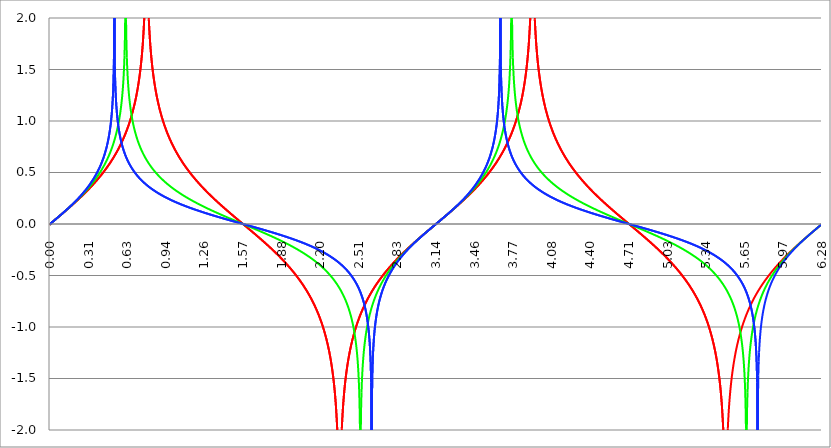
| Category | Series 1 | Series 0 | Series 2 |
|---|---|---|---|
| 0.0 | 0 | 0 | 0 |
| 0.00314159265358979 | -0.003 | -0.002 | -0.001 |
| 0.00628318530717958 | 0.006 | 0.006 | 0.006 |
| 0.00942477796076938 | 0.009 | 0.009 | 0.009 |
| 0.0125663706143592 | 0.013 | 0.013 | 0.013 |
| 0.015707963267949 | 0.016 | 0.016 | 0.016 |
| 0.0188495559215388 | 0.019 | 0.019 | 0.019 |
| 0.0219911485751285 | 0.022 | 0.022 | 0.022 |
| 0.0251327412287183 | 0.025 | 0.025 | 0.025 |
| 0.0282743338823081 | 0.028 | 0.028 | 0.028 |
| 0.0314159265358979 | 0.031 | 0.031 | 0.031 |
| 0.0345575191894877 | 0.035 | 0.035 | 0.035 |
| 0.0376991118430775 | 0.038 | 0.038 | 0.038 |
| 0.0408407044966673 | 0.041 | 0.041 | 0.041 |
| 0.0439822971502571 | 0.044 | 0.044 | 0.044 |
| 0.0471238898038469 | 0.047 | 0.047 | 0.047 |
| 0.0502654824574367 | 0.05 | 0.05 | 0.05 |
| 0.0534070751110265 | 0.054 | 0.054 | 0.054 |
| 0.0565486677646163 | 0.057 | 0.057 | 0.057 |
| 0.059690260418206 | 0.06 | 0.06 | 0.06 |
| 0.0628318530717958 | 0.063 | 0.063 | 0.063 |
| 0.0659734457253856 | 0.066 | 0.066 | 0.066 |
| 0.0691150383789754 | 0.069 | 0.069 | 0.07 |
| 0.0722566310325652 | 0.073 | 0.073 | 0.073 |
| 0.075398223686155 | 0.076 | 0.076 | 0.076 |
| 0.0785398163397448 | 0.079 | 0.079 | 0.079 |
| 0.0816814089933346 | 0.082 | 0.082 | 0.082 |
| 0.0848230016469244 | 0.085 | 0.085 | 0.086 |
| 0.0879645943005142 | 0.088 | 0.089 | 0.089 |
| 0.091106186954104 | 0.092 | 0.092 | 0.092 |
| 0.0942477796076937 | 0.095 | 0.095 | 0.095 |
| 0.0973893722612835 | 0.098 | 0.098 | 0.099 |
| 0.100530964914873 | 0.101 | 0.102 | 0.102 |
| 0.103672557568463 | 0.104 | 0.105 | 0.105 |
| 0.106814150222053 | 0.108 | 0.108 | 0.108 |
| 0.109955742875643 | 0.111 | 0.111 | 0.112 |
| 0.113097335529233 | 0.114 | 0.115 | 0.115 |
| 0.116238928182822 | 0.117 | 0.118 | 0.118 |
| 0.119380520836412 | 0.121 | 0.121 | 0.122 |
| 0.122522113490002 | 0.124 | 0.124 | 0.125 |
| 0.125663706143592 | 0.127 | 0.128 | 0.128 |
| 0.128805298797181 | 0.13 | 0.131 | 0.132 |
| 0.131946891450771 | 0.134 | 0.134 | 0.135 |
| 0.135088484104361 | 0.137 | 0.138 | 0.139 |
| 0.138230076757951 | 0.14 | 0.141 | 0.142 |
| 0.141371669411541 | 0.143 | 0.144 | 0.145 |
| 0.14451326206513 | 0.147 | 0.148 | 0.149 |
| 0.14765485471872 | 0.15 | 0.151 | 0.152 |
| 0.15079644737231 | 0.153 | 0.154 | 0.156 |
| 0.1539380400259 | 0.156 | 0.158 | 0.159 |
| 0.15707963267949 | 0.16 | 0.161 | 0.163 |
| 0.160221225333079 | 0.163 | 0.165 | 0.166 |
| 0.163362817986669 | 0.166 | 0.168 | 0.17 |
| 0.166504410640259 | 0.17 | 0.171 | 0.173 |
| 0.169646003293849 | 0.173 | 0.175 | 0.177 |
| 0.172787595947439 | 0.176 | 0.178 | 0.18 |
| 0.175929188601028 | 0.18 | 0.182 | 0.184 |
| 0.179070781254618 | 0.183 | 0.185 | 0.187 |
| 0.182212373908208 | 0.186 | 0.189 | 0.191 |
| 0.185353966561798 | 0.19 | 0.192 | 0.195 |
| 0.188495559215388 | 0.193 | 0.196 | 0.198 |
| 0.191637151868977 | 0.197 | 0.199 | 0.202 |
| 0.194778744522567 | 0.2 | 0.203 | 0.206 |
| 0.197920337176157 | 0.203 | 0.206 | 0.209 |
| 0.201061929829747 | 0.207 | 0.21 | 0.213 |
| 0.204203522483336 | 0.21 | 0.213 | 0.217 |
| 0.207345115136926 | 0.214 | 0.217 | 0.22 |
| 0.210486707790516 | 0.217 | 0.221 | 0.224 |
| 0.213628300444106 | 0.22 | 0.224 | 0.228 |
| 0.216769893097696 | 0.224 | 0.228 | 0.232 |
| 0.219911485751285 | 0.227 | 0.231 | 0.236 |
| 0.223053078404875 | 0.231 | 0.235 | 0.24 |
| 0.226194671058465 | 0.234 | 0.239 | 0.244 |
| 0.229336263712055 | 0.238 | 0.243 | 0.248 |
| 0.232477856365645 | 0.241 | 0.246 | 0.252 |
| 0.235619449019234 | 0.245 | 0.25 | 0.256 |
| 0.238761041672824 | 0.248 | 0.254 | 0.26 |
| 0.241902634326414 | 0.252 | 0.258 | 0.264 |
| 0.245044226980004 | 0.255 | 0.261 | 0.268 |
| 0.248185819633594 | 0.259 | 0.265 | 0.272 |
| 0.251327412287183 | 0.263 | 0.269 | 0.276 |
| 0.254469004940773 | 0.266 | 0.273 | 0.28 |
| 0.257610597594363 | 0.27 | 0.277 | 0.284 |
| 0.260752190247953 | 0.273 | 0.281 | 0.289 |
| 0.263893782901543 | 0.277 | 0.285 | 0.293 |
| 0.267035375555132 | 0.281 | 0.289 | 0.297 |
| 0.270176968208722 | 0.284 | 0.293 | 0.302 |
| 0.273318560862312 | 0.288 | 0.297 | 0.306 |
| 0.276460153515902 | 0.292 | 0.301 | 0.311 |
| 0.279601746169492 | 0.295 | 0.305 | 0.315 |
| 0.282743338823082 | 0.299 | 0.309 | 0.32 |
| 0.285884931476671 | 0.303 | 0.313 | 0.324 |
| 0.289026524130261 | 0.307 | 0.317 | 0.329 |
| 0.292168116783851 | 0.31 | 0.321 | 0.334 |
| 0.295309709437441 | 0.314 | 0.325 | 0.338 |
| 0.298451302091031 | 0.318 | 0.33 | 0.343 |
| 0.30159289474462 | 0.322 | 0.334 | 0.348 |
| 0.30473448739821 | 0.326 | 0.338 | 0.353 |
| 0.3078760800518 | 0.329 | 0.342 | 0.358 |
| 0.31101767270539 | 0.333 | 0.347 | 0.363 |
| 0.31415926535898 | 0.337 | 0.351 | 0.368 |
| 0.31730085801257 | 0.341 | 0.356 | 0.373 |
| 0.320442450666159 | 0.345 | 0.36 | 0.378 |
| 0.323584043319749 | 0.349 | 0.365 | 0.383 |
| 0.326725635973339 | 0.353 | 0.369 | 0.389 |
| 0.329867228626929 | 0.357 | 0.374 | 0.394 |
| 0.333008821280519 | 0.361 | 0.378 | 0.399 |
| 0.336150413934108 | 0.365 | 0.383 | 0.405 |
| 0.339292006587698 | 0.369 | 0.388 | 0.411 |
| 0.342433599241288 | 0.373 | 0.392 | 0.416 |
| 0.345575191894878 | 0.377 | 0.397 | 0.422 |
| 0.348716784548468 | 0.381 | 0.402 | 0.428 |
| 0.351858377202058 | 0.385 | 0.407 | 0.434 |
| 0.354999969855647 | 0.389 | 0.412 | 0.44 |
| 0.358141562509237 | 0.393 | 0.417 | 0.446 |
| 0.361283155162827 | 0.398 | 0.422 | 0.452 |
| 0.364424747816417 | 0.402 | 0.427 | 0.458 |
| 0.367566340470007 | 0.406 | 0.432 | 0.465 |
| 0.370707933123597 | 0.41 | 0.437 | 0.471 |
| 0.373849525777186 | 0.415 | 0.442 | 0.478 |
| 0.376991118430776 | 0.419 | 0.447 | 0.485 |
| 0.380132711084366 | 0.423 | 0.453 | 0.492 |
| 0.383274303737956 | 0.427 | 0.458 | 0.499 |
| 0.386415896391546 | 0.432 | 0.464 | 0.506 |
| 0.389557489045135 | 0.436 | 0.469 | 0.513 |
| 0.392699081698725 | 0.441 | 0.475 | 0.521 |
| 0.395840674352315 | 0.445 | 0.48 | 0.529 |
| 0.398982267005905 | 0.45 | 0.486 | 0.536 |
| 0.402123859659495 | 0.454 | 0.492 | 0.544 |
| 0.405265452313085 | 0.459 | 0.498 | 0.553 |
| 0.408407044966674 | 0.463 | 0.504 | 0.561 |
| 0.411548637620264 | 0.468 | 0.51 | 0.57 |
| 0.414690230273854 | 0.473 | 0.516 | 0.579 |
| 0.417831822927444 | 0.477 | 0.522 | 0.588 |
| 0.420973415581034 | 0.482 | 0.528 | 0.597 |
| 0.424115008234623 | 0.487 | 0.534 | 0.607 |
| 0.427256600888213 | 0.491 | 0.541 | 0.616 |
| 0.430398193541803 | 0.496 | 0.547 | 0.627 |
| 0.433539786195393 | 0.501 | 0.554 | 0.637 |
| 0.436681378848983 | 0.506 | 0.561 | 0.648 |
| 0.439822971502573 | 0.511 | 0.568 | 0.659 |
| 0.442964564156162 | 0.516 | 0.574 | 0.671 |
| 0.446106156809752 | 0.521 | 0.582 | 0.683 |
| 0.449247749463342 | 0.526 | 0.589 | 0.696 |
| 0.452389342116932 | 0.531 | 0.596 | 0.709 |
| 0.455530934770522 | 0.536 | 0.603 | 0.722 |
| 0.458672527424111 | 0.541 | 0.611 | 0.736 |
| 0.461814120077701 | 0.546 | 0.619 | 0.751 |
| 0.464955712731291 | 0.551 | 0.627 | 0.767 |
| 0.468097305384881 | 0.557 | 0.635 | 0.783 |
| 0.471238898038471 | 0.562 | 0.643 | 0.801 |
| 0.474380490692061 | 0.567 | 0.651 | 0.819 |
| 0.47752208334565 | 0.573 | 0.659 | 0.839 |
| 0.48066367599924 | 0.578 | 0.668 | 0.86 |
| 0.48380526865283 | 0.584 | 0.677 | 0.882 |
| 0.48694686130642 | 0.589 | 0.686 | 0.907 |
| 0.49008845396001 | 0.595 | 0.695 | 0.933 |
| 0.493230046613599 | 0.601 | 0.705 | 0.962 |
| 0.496371639267189 | 0.606 | 0.714 | 0.994 |
| 0.499513231920779 | 0.612 | 0.724 | 1.03 |
| 0.502654824574369 | 0.618 | 0.735 | 1.071 |
| 0.505796417227959 | 0.624 | 0.745 | 1.118 |
| 0.508938009881549 | 0.63 | 0.756 | 1.175 |
| 0.512079602535138 | 0.636 | 0.767 | 1.245 |
| 0.515221195188728 | 0.642 | 0.778 | 1.338 |
| 0.518362787842318 | 0.648 | 0.79 | 1.474 |
| 0.521504380495908 | 0.654 | 0.802 | 1.739 |
| 0.524645973149498 | 0.661 | 0.815 | 3 |
| 0.527787565803087 | 0.667 | 0.828 | 1.54 |
| 0.530929158456677 | 0.673 | 0.841 | 1.379 |
| 0.534070751110267 | 0.68 | 0.855 | 1.276 |
| 0.537212343763857 | 0.686 | 0.869 | 1.201 |
| 0.540353936417447 | 0.693 | 0.884 | 1.142 |
| 0.543495529071037 | 0.7 | 0.9 | 1.093 |
| 0.546637121724626 | 0.707 | 0.916 | 1.051 |
| 0.549778714378216 | 0.713 | 0.933 | 1.014 |
| 0.552920307031806 | 0.72 | 0.951 | 0.982 |
| 0.556061899685396 | 0.727 | 0.969 | 0.953 |
| 0.559203492338986 | 0.735 | 0.989 | 0.927 |
| 0.562345084992576 | 0.742 | 1.01 | 0.903 |
| 0.565486677646165 | 0.749 | 1.032 | 0.881 |
| 0.568628270299755 | 0.757 | 1.055 | 0.861 |
| 0.571769862953345 | 0.764 | 1.08 | 0.842 |
| 0.574911455606935 | 0.772 | 1.107 | 0.824 |
| 0.578053048260525 | 0.779 | 1.136 | 0.807 |
| 0.581194640914114 | 0.787 | 1.167 | 0.792 |
| 0.584336233567704 | 0.795 | 1.202 | 0.777 |
| 0.587477826221294 | 0.803 | 1.24 | 0.763 |
| 0.590619418874884 | 0.812 | 1.282 | 0.749 |
| 0.593761011528474 | 0.82 | 1.33 | 0.736 |
| 0.596902604182064 | 0.828 | 1.386 | 0.724 |
| 0.600044196835653 | 0.837 | 1.452 | 0.713 |
| 0.603185789489243 | 0.846 | 1.533 | 0.701 |
| 0.606327382142833 | 0.855 | 1.638 | 0.691 |
| 0.609468974796423 | 0.864 | 1.787 | 0.68 |
| 0.612610567450013 | 0.873 | 2.048 | 0.671 |
| 0.615752160103602 | 0.882 | 2.881 | 0.661 |
| 0.618893752757192 | 0.892 | 1.988 | 0.652 |
| 0.622035345410782 | 0.901 | 1.757 | 0.643 |
| 0.625176938064372 | 0.911 | 1.619 | 0.634 |
| 0.628318530717962 | 0.921 | 1.521 | 0.626 |
| 0.631460123371551 | 0.932 | 1.444 | 0.618 |
| 0.634601716025141 | 0.942 | 1.38 | 0.61 |
| 0.637743308678731 | 0.953 | 1.327 | 0.602 |
| 0.640884901332321 | 0.964 | 1.281 | 0.595 |
| 0.644026493985911 | 0.975 | 1.24 | 0.588 |
| 0.647168086639501 | 0.986 | 1.203 | 0.581 |
| 0.65030967929309 | 0.998 | 1.17 | 0.574 |
| 0.65345127194668 | 1.01 | 1.14 | 0.567 |
| 0.65659286460027 | 1.022 | 1.112 | 0.561 |
| 0.65973445725386 | 1.034 | 1.087 | 0.554 |
| 0.66287604990745 | 1.047 | 1.063 | 0.548 |
| 0.666017642561039 | 1.06 | 1.041 | 0.542 |
| 0.669159235214629 | 1.074 | 1.02 | 0.536 |
| 0.672300827868219 | 1.088 | 1 | 0.53 |
| 0.675442420521809 | 1.102 | 0.981 | 0.525 |
| 0.678584013175399 | 1.116 | 0.963 | 0.519 |
| 0.681725605828989 | 1.131 | 0.947 | 0.514 |
| 0.684867198482578 | 1.147 | 0.93 | 0.509 |
| 0.688008791136168 | 1.163 | 0.915 | 0.503 |
| 0.691150383789758 | 1.179 | 0.901 | 0.498 |
| 0.694291976443348 | 1.196 | 0.886 | 0.493 |
| 0.697433569096938 | 1.214 | 0.873 | 0.489 |
| 0.700575161750528 | 1.232 | 0.86 | 0.484 |
| 0.703716754404117 | 1.251 | 0.847 | 0.479 |
| 0.706858347057707 | 1.271 | 0.835 | 0.474 |
| 0.709999939711297 | 1.292 | 0.824 | 0.47 |
| 0.713141532364887 | 1.313 | 0.813 | 0.465 |
| 0.716283125018477 | 1.335 | 0.802 | 0.461 |
| 0.719424717672066 | 1.359 | 0.791 | 0.457 |
| 0.722566310325656 | 1.383 | 0.781 | 0.453 |
| 0.725707902979246 | 1.409 | 0.771 | 0.448 |
| 0.728849495632836 | 1.436 | 0.761 | 0.444 |
| 0.731991088286426 | 1.464 | 0.752 | 0.44 |
| 0.735132680940016 | 1.495 | 0.743 | 0.436 |
| 0.738274273593605 | 1.527 | 0.734 | 0.432 |
| 0.741415866247195 | 1.562 | 0.725 | 0.429 |
| 0.744557458900785 | 1.599 | 0.717 | 0.425 |
| 0.747699051554375 | 1.639 | 0.709 | 0.421 |
| 0.750840644207965 | 1.682 | 0.701 | 0.417 |
| 0.753982236861554 | 1.73 | 0.693 | 0.414 |
| 0.757123829515144 | 1.783 | 0.685 | 0.41 |
| 0.760265422168734 | 1.842 | 0.678 | 0.407 |
| 0.763407014822324 | 1.908 | 0.67 | 0.403 |
| 0.766548607475914 | 1.986 | 0.663 | 0.4 |
| 0.769690200129504 | 2.077 | 0.656 | 0.396 |
| 0.772831792783093 | 2.188 | 0.649 | 0.393 |
| 0.775973385436683 | 2.332 | 0.643 | 0.39 |
| 0.779114978090273 | 2.535 | 0.636 | 0.387 |
| 0.782256570743863 | 2.882 | 0.63 | 0.383 |
| 0.785398163397453 | 16.524 | 0.623 | 0.38 |
| 0.788539756051042 | 2.882 | 0.617 | 0.377 |
| 0.791681348704632 | 2.535 | 0.611 | 0.374 |
| 0.794822941358222 | 2.332 | 0.605 | 0.371 |
| 0.797964534011812 | 2.188 | 0.599 | 0.368 |
| 0.801106126665402 | 2.077 | 0.593 | 0.365 |
| 0.804247719318992 | 1.986 | 0.588 | 0.362 |
| 0.807389311972581 | 1.908 | 0.582 | 0.359 |
| 0.810530904626171 | 1.842 | 0.576 | 0.356 |
| 0.813672497279761 | 1.783 | 0.571 | 0.353 |
| 0.816814089933351 | 1.73 | 0.566 | 0.351 |
| 0.819955682586941 | 1.682 | 0.56 | 0.348 |
| 0.823097275240531 | 1.639 | 0.555 | 0.345 |
| 0.82623886789412 | 1.599 | 0.55 | 0.342 |
| 0.82938046054771 | 1.562 | 0.545 | 0.34 |
| 0.8325220532013 | 1.527 | 0.54 | 0.337 |
| 0.83566364585489 | 1.495 | 0.535 | 0.334 |
| 0.83880523850848 | 1.464 | 0.531 | 0.332 |
| 0.841946831162069 | 1.436 | 0.526 | 0.329 |
| 0.845088423815659 | 1.409 | 0.521 | 0.327 |
| 0.848230016469249 | 1.383 | 0.517 | 0.324 |
| 0.851371609122839 | 1.359 | 0.512 | 0.322 |
| 0.854513201776429 | 1.335 | 0.508 | 0.319 |
| 0.857654794430019 | 1.313 | 0.503 | 0.317 |
| 0.860796387083608 | 1.292 | 0.499 | 0.314 |
| 0.863937979737198 | 1.271 | 0.494 | 0.312 |
| 0.867079572390788 | 1.251 | 0.49 | 0.309 |
| 0.870221165044378 | 1.232 | 0.486 | 0.307 |
| 0.873362757697968 | 1.214 | 0.482 | 0.305 |
| 0.876504350351557 | 1.196 | 0.478 | 0.302 |
| 0.879645943005147 | 1.179 | 0.474 | 0.3 |
| 0.882787535658737 | 1.163 | 0.47 | 0.298 |
| 0.885929128312327 | 1.147 | 0.466 | 0.296 |
| 0.889070720965917 | 1.131 | 0.462 | 0.293 |
| 0.892212313619507 | 1.116 | 0.458 | 0.291 |
| 0.895353906273096 | 1.102 | 0.454 | 0.289 |
| 0.898495498926686 | 1.088 | 0.45 | 0.287 |
| 0.901637091580276 | 1.074 | 0.447 | 0.285 |
| 0.904778684233866 | 1.06 | 0.443 | 0.283 |
| 0.907920276887456 | 1.047 | 0.439 | 0.28 |
| 0.911061869541045 | 1.034 | 0.436 | 0.278 |
| 0.914203462194635 | 1.022 | 0.432 | 0.276 |
| 0.917345054848225 | 1.01 | 0.429 | 0.274 |
| 0.920486647501815 | 0.998 | 0.425 | 0.272 |
| 0.923628240155405 | 0.986 | 0.422 | 0.27 |
| 0.926769832808995 | 0.975 | 0.418 | 0.268 |
| 0.929911425462584 | 0.964 | 0.415 | 0.266 |
| 0.933053018116174 | 0.953 | 0.411 | 0.264 |
| 0.936194610769764 | 0.942 | 0.408 | 0.262 |
| 0.939336203423354 | 0.932 | 0.405 | 0.26 |
| 0.942477796076944 | 0.921 | 0.401 | 0.258 |
| 0.945619388730533 | 0.911 | 0.398 | 0.256 |
| 0.948760981384123 | 0.901 | 0.395 | 0.254 |
| 0.951902574037713 | 0.892 | 0.392 | 0.252 |
| 0.955044166691303 | 0.882 | 0.389 | 0.25 |
| 0.958185759344893 | 0.873 | 0.386 | 0.249 |
| 0.961327351998483 | 0.864 | 0.382 | 0.247 |
| 0.964468944652072 | 0.855 | 0.379 | 0.245 |
| 0.967610537305662 | 0.846 | 0.376 | 0.243 |
| 0.970752129959252 | 0.837 | 0.373 | 0.241 |
| 0.973893722612842 | 0.828 | 0.37 | 0.239 |
| 0.977035315266432 | 0.82 | 0.367 | 0.238 |
| 0.980176907920022 | 0.812 | 0.364 | 0.236 |
| 0.983318500573611 | 0.803 | 0.361 | 0.234 |
| 0.986460093227201 | 0.795 | 0.359 | 0.232 |
| 0.989601685880791 | 0.787 | 0.356 | 0.23 |
| 0.992743278534381 | 0.779 | 0.353 | 0.229 |
| 0.995884871187971 | 0.772 | 0.35 | 0.227 |
| 0.99902646384156 | 0.764 | 0.347 | 0.225 |
| 1.00216805649515 | 0.757 | 0.344 | 0.224 |
| 1.00530964914874 | 0.749 | 0.342 | 0.222 |
| 1.00845124180233 | 0.742 | 0.339 | 0.22 |
| 1.01159283445592 | 0.735 | 0.336 | 0.218 |
| 1.01473442710951 | 0.727 | 0.333 | 0.217 |
| 1.017876019763099 | 0.72 | 0.331 | 0.215 |
| 1.021017612416689 | 0.713 | 0.328 | 0.213 |
| 1.02415920507028 | 0.707 | 0.325 | 0.212 |
| 1.027300797723869 | 0.7 | 0.323 | 0.21 |
| 1.030442390377459 | 0.693 | 0.32 | 0.209 |
| 1.033583983031048 | 0.686 | 0.318 | 0.207 |
| 1.036725575684638 | 0.68 | 0.315 | 0.205 |
| 1.039867168338228 | 0.673 | 0.312 | 0.204 |
| 1.043008760991818 | 0.667 | 0.31 | 0.202 |
| 1.046150353645408 | 0.661 | 0.307 | 0.201 |
| 1.049291946298998 | 0.654 | 0.305 | 0.199 |
| 1.052433538952587 | 0.648 | 0.302 | 0.197 |
| 1.055575131606177 | 0.642 | 0.3 | 0.196 |
| 1.058716724259767 | 0.636 | 0.297 | 0.194 |
| 1.061858316913357 | 0.63 | 0.295 | 0.193 |
| 1.064999909566947 | 0.624 | 0.293 | 0.191 |
| 1.068141502220536 | 0.618 | 0.29 | 0.19 |
| 1.071283094874126 | 0.612 | 0.288 | 0.188 |
| 1.074424687527716 | 0.606 | 0.285 | 0.187 |
| 1.077566280181306 | 0.601 | 0.283 | 0.185 |
| 1.080707872834896 | 0.595 | 0.281 | 0.184 |
| 1.083849465488486 | 0.589 | 0.278 | 0.182 |
| 1.086991058142075 | 0.584 | 0.276 | 0.181 |
| 1.090132650795665 | 0.578 | 0.274 | 0.179 |
| 1.093274243449255 | 0.573 | 0.271 | 0.178 |
| 1.096415836102845 | 0.567 | 0.269 | 0.176 |
| 1.099557428756435 | 0.562 | 0.267 | 0.175 |
| 1.102699021410025 | 0.557 | 0.264 | 0.174 |
| 1.105840614063614 | 0.551 | 0.262 | 0.172 |
| 1.108982206717204 | 0.546 | 0.26 | 0.171 |
| 1.112123799370794 | 0.541 | 0.258 | 0.169 |
| 1.115265392024384 | 0.536 | 0.256 | 0.168 |
| 1.118406984677974 | 0.531 | 0.253 | 0.166 |
| 1.121548577331563 | 0.526 | 0.251 | 0.165 |
| 1.124690169985153 | 0.521 | 0.249 | 0.164 |
| 1.127831762638743 | 0.516 | 0.247 | 0.162 |
| 1.130973355292333 | 0.511 | 0.245 | 0.161 |
| 1.134114947945923 | 0.506 | 0.242 | 0.16 |
| 1.137256540599513 | 0.501 | 0.24 | 0.158 |
| 1.140398133253102 | 0.496 | 0.238 | 0.157 |
| 1.143539725906692 | 0.491 | 0.236 | 0.155 |
| 1.146681318560282 | 0.487 | 0.234 | 0.154 |
| 1.149822911213872 | 0.482 | 0.232 | 0.153 |
| 1.152964503867462 | 0.477 | 0.23 | 0.151 |
| 1.156106096521051 | 0.473 | 0.228 | 0.15 |
| 1.159247689174641 | 0.468 | 0.226 | 0.149 |
| 1.162389281828231 | 0.463 | 0.224 | 0.147 |
| 1.165530874481821 | 0.459 | 0.221 | 0.146 |
| 1.168672467135411 | 0.454 | 0.219 | 0.145 |
| 1.171814059789001 | 0.45 | 0.217 | 0.143 |
| 1.17495565244259 | 0.445 | 0.215 | 0.142 |
| 1.17809724509618 | 0.441 | 0.213 | 0.141 |
| 1.18123883774977 | 0.436 | 0.211 | 0.139 |
| 1.18438043040336 | 0.432 | 0.209 | 0.138 |
| 1.18752202305695 | 0.427 | 0.207 | 0.137 |
| 1.190663615710539 | 0.423 | 0.205 | 0.136 |
| 1.193805208364129 | 0.419 | 0.203 | 0.134 |
| 1.19694680101772 | 0.415 | 0.201 | 0.133 |
| 1.200088393671309 | 0.41 | 0.199 | 0.132 |
| 1.203229986324899 | 0.406 | 0.198 | 0.131 |
| 1.206371578978489 | 0.402 | 0.196 | 0.129 |
| 1.209513171632078 | 0.398 | 0.194 | 0.128 |
| 1.212654764285668 | 0.393 | 0.192 | 0.127 |
| 1.215796356939258 | 0.389 | 0.19 | 0.126 |
| 1.218937949592848 | 0.385 | 0.188 | 0.124 |
| 1.222079542246438 | 0.381 | 0.186 | 0.123 |
| 1.225221134900027 | 0.377 | 0.184 | 0.122 |
| 1.228362727553617 | 0.373 | 0.182 | 0.121 |
| 1.231504320207207 | 0.369 | 0.18 | 0.119 |
| 1.234645912860797 | 0.365 | 0.178 | 0.118 |
| 1.237787505514387 | 0.361 | 0.177 | 0.117 |
| 1.240929098167977 | 0.357 | 0.175 | 0.116 |
| 1.244070690821566 | 0.353 | 0.173 | 0.114 |
| 1.247212283475156 | 0.349 | 0.171 | 0.113 |
| 1.250353876128746 | 0.345 | 0.169 | 0.112 |
| 1.253495468782336 | 0.341 | 0.167 | 0.111 |
| 1.256637061435926 | 0.337 | 0.165 | 0.11 |
| 1.259778654089515 | 0.333 | 0.164 | 0.108 |
| 1.262920246743105 | 0.329 | 0.162 | 0.107 |
| 1.266061839396695 | 0.326 | 0.16 | 0.106 |
| 1.269203432050285 | 0.322 | 0.158 | 0.105 |
| 1.272345024703875 | 0.318 | 0.156 | 0.104 |
| 1.275486617357465 | 0.314 | 0.155 | 0.102 |
| 1.278628210011054 | 0.31 | 0.153 | 0.101 |
| 1.281769802664644 | 0.307 | 0.151 | 0.1 |
| 1.284911395318234 | 0.303 | 0.149 | 0.099 |
| 1.288052987971824 | 0.299 | 0.147 | 0.098 |
| 1.291194580625414 | 0.295 | 0.146 | 0.097 |
| 1.294336173279003 | 0.292 | 0.144 | 0.095 |
| 1.297477765932593 | 0.288 | 0.142 | 0.094 |
| 1.300619358586183 | 0.284 | 0.14 | 0.093 |
| 1.303760951239773 | 0.281 | 0.139 | 0.092 |
| 1.306902543893363 | 0.277 | 0.137 | 0.091 |
| 1.310044136546953 | 0.273 | 0.135 | 0.09 |
| 1.313185729200542 | 0.27 | 0.133 | 0.089 |
| 1.316327321854132 | 0.266 | 0.132 | 0.087 |
| 1.319468914507722 | 0.263 | 0.13 | 0.086 |
| 1.322610507161312 | 0.259 | 0.128 | 0.085 |
| 1.325752099814902 | 0.255 | 0.126 | 0.084 |
| 1.328893692468491 | 0.252 | 0.125 | 0.083 |
| 1.332035285122081 | 0.248 | 0.123 | 0.082 |
| 1.335176877775671 | 0.245 | 0.121 | 0.081 |
| 1.338318470429261 | 0.241 | 0.12 | 0.079 |
| 1.341460063082851 | 0.238 | 0.118 | 0.078 |
| 1.344601655736441 | 0.234 | 0.116 | 0.077 |
| 1.34774324839003 | 0.231 | 0.114 | 0.076 |
| 1.35088484104362 | 0.227 | 0.113 | 0.075 |
| 1.35402643369721 | 0.224 | 0.111 | 0.074 |
| 1.3571680263508 | 0.22 | 0.109 | 0.073 |
| 1.36030961900439 | 0.217 | 0.108 | 0.072 |
| 1.363451211657979 | 0.214 | 0.106 | 0.07 |
| 1.36659280431157 | 0.21 | 0.104 | 0.069 |
| 1.369734396965159 | 0.207 | 0.103 | 0.068 |
| 1.372875989618749 | 0.203 | 0.101 | 0.067 |
| 1.376017582272339 | 0.2 | 0.099 | 0.066 |
| 1.379159174925929 | 0.197 | 0.098 | 0.065 |
| 1.382300767579518 | 0.193 | 0.096 | 0.064 |
| 1.385442360233108 | 0.19 | 0.094 | 0.063 |
| 1.388583952886698 | 0.186 | 0.093 | 0.062 |
| 1.391725545540288 | 0.183 | 0.091 | 0.061 |
| 1.394867138193878 | 0.18 | 0.089 | 0.059 |
| 1.398008730847468 | 0.176 | 0.088 | 0.058 |
| 1.401150323501057 | 0.173 | 0.086 | 0.057 |
| 1.404291916154647 | 0.17 | 0.084 | 0.056 |
| 1.407433508808237 | 0.166 | 0.083 | 0.055 |
| 1.410575101461827 | 0.163 | 0.081 | 0.054 |
| 1.413716694115417 | 0.16 | 0.08 | 0.053 |
| 1.416858286769006 | 0.156 | 0.078 | 0.052 |
| 1.419999879422596 | 0.153 | 0.076 | 0.051 |
| 1.423141472076186 | 0.15 | 0.075 | 0.05 |
| 1.426283064729776 | 0.147 | 0.073 | 0.049 |
| 1.429424657383366 | 0.143 | 0.071 | 0.048 |
| 1.432566250036956 | 0.14 | 0.07 | 0.046 |
| 1.435707842690545 | 0.137 | 0.068 | 0.045 |
| 1.438849435344135 | 0.134 | 0.067 | 0.044 |
| 1.441991027997725 | 0.13 | 0.065 | 0.043 |
| 1.445132620651315 | 0.127 | 0.063 | 0.042 |
| 1.448274213304905 | 0.124 | 0.062 | 0.041 |
| 1.451415805958494 | 0.121 | 0.06 | 0.04 |
| 1.454557398612084 | 0.117 | 0.059 | 0.039 |
| 1.457698991265674 | 0.114 | 0.057 | 0.038 |
| 1.460840583919264 | 0.111 | 0.055 | 0.037 |
| 1.463982176572854 | 0.108 | 0.054 | 0.036 |
| 1.467123769226444 | 0.104 | 0.052 | 0.035 |
| 1.470265361880033 | 0.101 | 0.051 | 0.034 |
| 1.473406954533623 | 0.098 | 0.049 | 0.033 |
| 1.476548547187213 | 0.095 | 0.047 | 0.032 |
| 1.479690139840803 | 0.092 | 0.046 | 0.03 |
| 1.482831732494393 | 0.088 | 0.044 | 0.029 |
| 1.485973325147982 | 0.085 | 0.043 | 0.028 |
| 1.489114917801572 | 0.082 | 0.041 | 0.027 |
| 1.492256510455162 | 0.079 | 0.039 | 0.026 |
| 1.495398103108752 | 0.076 | 0.038 | 0.025 |
| 1.498539695762342 | 0.073 | 0.036 | 0.024 |
| 1.501681288415932 | 0.069 | 0.035 | 0.023 |
| 1.504822881069521 | 0.066 | 0.033 | 0.022 |
| 1.507964473723111 | 0.063 | 0.031 | 0.021 |
| 1.511106066376701 | 0.06 | 0.03 | 0.02 |
| 1.514247659030291 | 0.057 | 0.028 | 0.019 |
| 1.517389251683881 | 0.054 | 0.027 | 0.018 |
| 1.520530844337471 | 0.05 | 0.025 | 0.017 |
| 1.52367243699106 | 0.047 | 0.024 | 0.016 |
| 1.52681402964465 | 0.044 | 0.022 | 0.015 |
| 1.52995562229824 | 0.041 | 0.02 | 0.014 |
| 1.53309721495183 | 0.038 | 0.019 | 0.013 |
| 1.53623880760542 | 0.035 | 0.017 | 0.012 |
| 1.539380400259009 | 0.031 | 0.016 | 0.01 |
| 1.542521992912599 | 0.028 | 0.014 | 0.009 |
| 1.545663585566189 | 0.025 | 0.013 | 0.008 |
| 1.548805178219779 | 0.022 | 0.011 | 0.007 |
| 1.551946770873369 | 0.019 | 0.009 | 0.006 |
| 1.555088363526959 | 0.016 | 0.008 | 0.005 |
| 1.558229956180548 | 0.013 | 0.006 | 0.004 |
| 1.561371548834138 | 0.009 | 0.005 | 0.003 |
| 1.564513141487728 | 0.006 | 0.003 | 0.002 |
| 1.567654734141318 | 0.003 | 0.002 | 0.001 |
| 1.570796326794908 | 0 | 0 | 0 |
| 1.573937919448497 | -0.003 | -0.002 | -0.001 |
| 1.577079512102087 | -0.006 | -0.003 | -0.002 |
| 1.580221104755677 | -0.009 | -0.005 | -0.003 |
| 1.583362697409267 | -0.013 | -0.006 | -0.004 |
| 1.586504290062857 | -0.016 | -0.008 | -0.005 |
| 1.589645882716447 | -0.019 | -0.009 | -0.006 |
| 1.592787475370036 | -0.022 | -0.011 | -0.007 |
| 1.595929068023626 | -0.025 | -0.013 | -0.008 |
| 1.599070660677216 | -0.028 | -0.014 | -0.009 |
| 1.602212253330806 | -0.031 | -0.016 | -0.01 |
| 1.605353845984396 | -0.035 | -0.017 | -0.012 |
| 1.608495438637985 | -0.038 | -0.019 | -0.013 |
| 1.611637031291575 | -0.041 | -0.02 | -0.014 |
| 1.614778623945165 | -0.044 | -0.022 | -0.015 |
| 1.617920216598755 | -0.047 | -0.024 | -0.016 |
| 1.621061809252345 | -0.05 | -0.025 | -0.017 |
| 1.624203401905935 | -0.054 | -0.027 | -0.018 |
| 1.627344994559524 | -0.057 | -0.028 | -0.019 |
| 1.630486587213114 | -0.06 | -0.03 | -0.02 |
| 1.633628179866704 | -0.063 | -0.031 | -0.021 |
| 1.636769772520294 | -0.066 | -0.033 | -0.022 |
| 1.639911365173884 | -0.069 | -0.035 | -0.023 |
| 1.643052957827473 | -0.073 | -0.036 | -0.024 |
| 1.646194550481063 | -0.076 | -0.038 | -0.025 |
| 1.649336143134653 | -0.079 | -0.039 | -0.026 |
| 1.652477735788243 | -0.082 | -0.041 | -0.027 |
| 1.655619328441833 | -0.085 | -0.043 | -0.028 |
| 1.658760921095423 | -0.088 | -0.044 | -0.029 |
| 1.661902513749012 | -0.092 | -0.046 | -0.03 |
| 1.665044106402602 | -0.095 | -0.047 | -0.032 |
| 1.668185699056192 | -0.098 | -0.049 | -0.033 |
| 1.671327291709782 | -0.101 | -0.051 | -0.034 |
| 1.674468884363372 | -0.104 | -0.052 | -0.035 |
| 1.677610477016961 | -0.108 | -0.054 | -0.036 |
| 1.680752069670551 | -0.111 | -0.055 | -0.037 |
| 1.683893662324141 | -0.114 | -0.057 | -0.038 |
| 1.687035254977731 | -0.117 | -0.059 | -0.039 |
| 1.690176847631321 | -0.121 | -0.06 | -0.04 |
| 1.693318440284911 | -0.124 | -0.062 | -0.041 |
| 1.6964600329385 | -0.127 | -0.063 | -0.042 |
| 1.69960162559209 | -0.13 | -0.065 | -0.043 |
| 1.70274321824568 | -0.134 | -0.067 | -0.044 |
| 1.70588481089927 | -0.137 | -0.068 | -0.045 |
| 1.70902640355286 | -0.14 | -0.07 | -0.046 |
| 1.712167996206449 | -0.143 | -0.071 | -0.048 |
| 1.715309588860039 | -0.147 | -0.073 | -0.049 |
| 1.71845118151363 | -0.15 | -0.075 | -0.05 |
| 1.721592774167219 | -0.153 | -0.076 | -0.051 |
| 1.724734366820809 | -0.156 | -0.078 | -0.052 |
| 1.727875959474399 | -0.16 | -0.08 | -0.053 |
| 1.731017552127988 | -0.163 | -0.081 | -0.054 |
| 1.734159144781578 | -0.166 | -0.083 | -0.055 |
| 1.737300737435168 | -0.17 | -0.084 | -0.056 |
| 1.740442330088758 | -0.173 | -0.086 | -0.057 |
| 1.743583922742348 | -0.176 | -0.088 | -0.058 |
| 1.746725515395937 | -0.18 | -0.089 | -0.059 |
| 1.749867108049527 | -0.183 | -0.091 | -0.061 |
| 1.753008700703117 | -0.186 | -0.093 | -0.062 |
| 1.756150293356707 | -0.19 | -0.094 | -0.063 |
| 1.759291886010297 | -0.193 | -0.096 | -0.064 |
| 1.762433478663887 | -0.197 | -0.098 | -0.065 |
| 1.765575071317476 | -0.2 | -0.099 | -0.066 |
| 1.768716663971066 | -0.203 | -0.101 | -0.067 |
| 1.771858256624656 | -0.207 | -0.103 | -0.068 |
| 1.774999849278246 | -0.21 | -0.104 | -0.069 |
| 1.778141441931836 | -0.214 | -0.106 | -0.07 |
| 1.781283034585426 | -0.217 | -0.108 | -0.072 |
| 1.784424627239015 | -0.22 | -0.109 | -0.073 |
| 1.787566219892605 | -0.224 | -0.111 | -0.074 |
| 1.790707812546195 | -0.227 | -0.113 | -0.075 |
| 1.793849405199785 | -0.231 | -0.114 | -0.076 |
| 1.796990997853375 | -0.234 | -0.116 | -0.077 |
| 1.800132590506964 | -0.238 | -0.118 | -0.078 |
| 1.803274183160554 | -0.241 | -0.12 | -0.079 |
| 1.806415775814144 | -0.245 | -0.121 | -0.081 |
| 1.809557368467734 | -0.248 | -0.123 | -0.082 |
| 1.812698961121324 | -0.252 | -0.125 | -0.083 |
| 1.815840553774914 | -0.255 | -0.126 | -0.084 |
| 1.818982146428503 | -0.259 | -0.128 | -0.085 |
| 1.822123739082093 | -0.263 | -0.13 | -0.086 |
| 1.825265331735683 | -0.266 | -0.132 | -0.087 |
| 1.828406924389273 | -0.27 | -0.133 | -0.089 |
| 1.831548517042863 | -0.273 | -0.135 | -0.09 |
| 1.834690109696452 | -0.277 | -0.137 | -0.091 |
| 1.837831702350042 | -0.281 | -0.139 | -0.092 |
| 1.840973295003632 | -0.284 | -0.14 | -0.093 |
| 1.844114887657222 | -0.288 | -0.142 | -0.094 |
| 1.847256480310812 | -0.292 | -0.144 | -0.095 |
| 1.850398072964402 | -0.295 | -0.146 | -0.097 |
| 1.853539665617991 | -0.299 | -0.147 | -0.098 |
| 1.856681258271581 | -0.303 | -0.149 | -0.099 |
| 1.859822850925171 | -0.307 | -0.151 | -0.1 |
| 1.862964443578761 | -0.31 | -0.153 | -0.101 |
| 1.866106036232351 | -0.314 | -0.155 | -0.102 |
| 1.86924762888594 | -0.318 | -0.156 | -0.104 |
| 1.87238922153953 | -0.322 | -0.158 | -0.105 |
| 1.87553081419312 | -0.326 | -0.16 | -0.106 |
| 1.87867240684671 | -0.329 | -0.162 | -0.107 |
| 1.8818139995003 | -0.333 | -0.164 | -0.108 |
| 1.88495559215389 | -0.337 | -0.165 | -0.11 |
| 1.888097184807479 | -0.341 | -0.167 | -0.111 |
| 1.891238777461069 | -0.345 | -0.169 | -0.112 |
| 1.89438037011466 | -0.349 | -0.171 | -0.113 |
| 1.897521962768249 | -0.353 | -0.173 | -0.114 |
| 1.900663555421839 | -0.357 | -0.175 | -0.116 |
| 1.903805148075429 | -0.361 | -0.177 | -0.117 |
| 1.906946740729018 | -0.365 | -0.178 | -0.118 |
| 1.910088333382608 | -0.369 | -0.18 | -0.119 |
| 1.913229926036198 | -0.373 | -0.182 | -0.121 |
| 1.916371518689788 | -0.377 | -0.184 | -0.122 |
| 1.919513111343378 | -0.381 | -0.186 | -0.123 |
| 1.922654703996967 | -0.385 | -0.188 | -0.124 |
| 1.925796296650557 | -0.389 | -0.19 | -0.126 |
| 1.928937889304147 | -0.393 | -0.192 | -0.127 |
| 1.932079481957737 | -0.398 | -0.194 | -0.128 |
| 1.935221074611327 | -0.402 | -0.196 | -0.129 |
| 1.938362667264917 | -0.406 | -0.198 | -0.131 |
| 1.941504259918506 | -0.41 | -0.199 | -0.132 |
| 1.944645852572096 | -0.415 | -0.201 | -0.133 |
| 1.947787445225686 | -0.419 | -0.203 | -0.134 |
| 1.950929037879276 | -0.423 | -0.205 | -0.136 |
| 1.954070630532866 | -0.427 | -0.207 | -0.137 |
| 1.957212223186455 | -0.432 | -0.209 | -0.138 |
| 1.960353815840045 | -0.436 | -0.211 | -0.139 |
| 1.963495408493635 | -0.441 | -0.213 | -0.141 |
| 1.966637001147225 | -0.445 | -0.215 | -0.142 |
| 1.969778593800815 | -0.45 | -0.217 | -0.143 |
| 1.972920186454405 | -0.454 | -0.219 | -0.145 |
| 1.976061779107994 | -0.459 | -0.221 | -0.146 |
| 1.979203371761584 | -0.463 | -0.224 | -0.147 |
| 1.982344964415174 | -0.468 | -0.226 | -0.149 |
| 1.985486557068764 | -0.473 | -0.228 | -0.15 |
| 1.988628149722354 | -0.477 | -0.23 | -0.151 |
| 1.991769742375943 | -0.482 | -0.232 | -0.153 |
| 1.994911335029533 | -0.487 | -0.234 | -0.154 |
| 1.998052927683123 | -0.491 | -0.236 | -0.155 |
| 2.001194520336712 | -0.496 | -0.238 | -0.157 |
| 2.004336112990302 | -0.501 | -0.24 | -0.158 |
| 2.007477705643892 | -0.506 | -0.242 | -0.16 |
| 2.010619298297482 | -0.511 | -0.245 | -0.161 |
| 2.013760890951071 | -0.516 | -0.247 | -0.162 |
| 2.016902483604661 | -0.521 | -0.249 | -0.164 |
| 2.02004407625825 | -0.526 | -0.251 | -0.165 |
| 2.02318566891184 | -0.531 | -0.253 | -0.166 |
| 2.02632726156543 | -0.536 | -0.256 | -0.168 |
| 2.029468854219019 | -0.541 | -0.258 | -0.169 |
| 2.032610446872609 | -0.546 | -0.26 | -0.171 |
| 2.035752039526198 | -0.551 | -0.262 | -0.172 |
| 2.038893632179788 | -0.557 | -0.264 | -0.174 |
| 2.042035224833378 | -0.562 | -0.267 | -0.175 |
| 2.045176817486967 | -0.567 | -0.269 | -0.176 |
| 2.048318410140557 | -0.573 | -0.271 | -0.178 |
| 2.051460002794146 | -0.578 | -0.274 | -0.179 |
| 2.054601595447736 | -0.584 | -0.276 | -0.181 |
| 2.057743188101325 | -0.589 | -0.278 | -0.182 |
| 2.060884780754915 | -0.595 | -0.281 | -0.184 |
| 2.064026373408505 | -0.601 | -0.283 | -0.185 |
| 2.067167966062094 | -0.606 | -0.285 | -0.187 |
| 2.070309558715684 | -0.612 | -0.288 | -0.188 |
| 2.073451151369273 | -0.618 | -0.29 | -0.19 |
| 2.076592744022863 | -0.624 | -0.293 | -0.191 |
| 2.079734336676452 | -0.63 | -0.295 | -0.193 |
| 2.082875929330042 | -0.636 | -0.297 | -0.194 |
| 2.086017521983632 | -0.642 | -0.3 | -0.196 |
| 2.089159114637221 | -0.648 | -0.302 | -0.197 |
| 2.092300707290811 | -0.654 | -0.305 | -0.199 |
| 2.095442299944401 | -0.661 | -0.307 | -0.201 |
| 2.09858389259799 | -0.667 | -0.31 | -0.202 |
| 2.10172548525158 | -0.673 | -0.312 | -0.204 |
| 2.104867077905169 | -0.68 | -0.315 | -0.205 |
| 2.108008670558759 | -0.686 | -0.318 | -0.207 |
| 2.111150263212349 | -0.693 | -0.32 | -0.209 |
| 2.114291855865938 | -0.7 | -0.323 | -0.21 |
| 2.117433448519528 | -0.707 | -0.325 | -0.212 |
| 2.120575041173117 | -0.713 | -0.328 | -0.213 |
| 2.123716633826707 | -0.72 | -0.331 | -0.215 |
| 2.126858226480297 | -0.727 | -0.333 | -0.217 |
| 2.129999819133886 | -0.735 | -0.336 | -0.218 |
| 2.133141411787476 | -0.742 | -0.339 | -0.22 |
| 2.136283004441065 | -0.749 | -0.342 | -0.222 |
| 2.139424597094655 | -0.757 | -0.344 | -0.224 |
| 2.142566189748245 | -0.764 | -0.347 | -0.225 |
| 2.145707782401834 | -0.772 | -0.35 | -0.227 |
| 2.148849375055424 | -0.779 | -0.353 | -0.229 |
| 2.151990967709013 | -0.787 | -0.356 | -0.23 |
| 2.155132560362603 | -0.795 | -0.359 | -0.232 |
| 2.158274153016193 | -0.803 | -0.361 | -0.234 |
| 2.161415745669782 | -0.812 | -0.364 | -0.236 |
| 2.164557338323372 | -0.82 | -0.367 | -0.238 |
| 2.167698930976961 | -0.828 | -0.37 | -0.239 |
| 2.170840523630551 | -0.837 | -0.373 | -0.241 |
| 2.173982116284141 | -0.846 | -0.376 | -0.243 |
| 2.17712370893773 | -0.855 | -0.379 | -0.245 |
| 2.18026530159132 | -0.864 | -0.382 | -0.247 |
| 2.183406894244909 | -0.873 | -0.386 | -0.249 |
| 2.186548486898499 | -0.882 | -0.389 | -0.25 |
| 2.189690079552089 | -0.892 | -0.392 | -0.252 |
| 2.192831672205678 | -0.901 | -0.395 | -0.254 |
| 2.195973264859268 | -0.911 | -0.398 | -0.256 |
| 2.199114857512857 | -0.921 | -0.401 | -0.258 |
| 2.202256450166447 | -0.932 | -0.405 | -0.26 |
| 2.205398042820036 | -0.942 | -0.408 | -0.262 |
| 2.208539635473626 | -0.953 | -0.411 | -0.264 |
| 2.211681228127216 | -0.964 | -0.415 | -0.266 |
| 2.214822820780805 | -0.975 | -0.418 | -0.268 |
| 2.217964413434395 | -0.986 | -0.422 | -0.27 |
| 2.221106006087984 | -0.998 | -0.425 | -0.272 |
| 2.224247598741574 | -1.01 | -0.429 | -0.274 |
| 2.227389191395164 | -1.022 | -0.432 | -0.276 |
| 2.230530784048753 | -1.034 | -0.436 | -0.278 |
| 2.233672376702343 | -1.047 | -0.439 | -0.28 |
| 2.236813969355933 | -1.06 | -0.443 | -0.283 |
| 2.239955562009522 | -1.074 | -0.447 | -0.285 |
| 2.243097154663112 | -1.088 | -0.45 | -0.287 |
| 2.246238747316701 | -1.102 | -0.454 | -0.289 |
| 2.249380339970291 | -1.116 | -0.458 | -0.291 |
| 2.252521932623881 | -1.131 | -0.462 | -0.293 |
| 2.25566352527747 | -1.147 | -0.466 | -0.296 |
| 2.25880511793106 | -1.163 | -0.47 | -0.298 |
| 2.261946710584649 | -1.179 | -0.474 | -0.3 |
| 2.265088303238239 | -1.196 | -0.478 | -0.302 |
| 2.268229895891829 | -1.214 | -0.482 | -0.305 |
| 2.271371488545418 | -1.232 | -0.486 | -0.307 |
| 2.274513081199008 | -1.251 | -0.49 | -0.309 |
| 2.277654673852597 | -1.271 | -0.494 | -0.312 |
| 2.280796266506186 | -1.292 | -0.499 | -0.314 |
| 2.283937859159776 | -1.313 | -0.503 | -0.317 |
| 2.287079451813366 | -1.335 | -0.508 | -0.319 |
| 2.290221044466955 | -1.359 | -0.512 | -0.322 |
| 2.293362637120545 | -1.383 | -0.517 | -0.324 |
| 2.296504229774135 | -1.409 | -0.521 | -0.327 |
| 2.299645822427724 | -1.436 | -0.526 | -0.329 |
| 2.302787415081314 | -1.464 | -0.531 | -0.332 |
| 2.305929007734904 | -1.495 | -0.535 | -0.334 |
| 2.309070600388493 | -1.527 | -0.54 | -0.337 |
| 2.312212193042083 | -1.562 | -0.545 | -0.34 |
| 2.315353785695672 | -1.599 | -0.55 | -0.342 |
| 2.318495378349262 | -1.639 | -0.555 | -0.345 |
| 2.321636971002852 | -1.682 | -0.56 | -0.348 |
| 2.324778563656441 | -1.73 | -0.566 | -0.351 |
| 2.327920156310031 | -1.783 | -0.571 | -0.353 |
| 2.33106174896362 | -1.842 | -0.576 | -0.356 |
| 2.33420334161721 | -1.908 | -0.582 | -0.359 |
| 2.3373449342708 | -1.986 | -0.588 | -0.362 |
| 2.340486526924389 | -2.077 | -0.593 | -0.365 |
| 2.343628119577979 | -2.188 | -0.599 | -0.368 |
| 2.346769712231568 | -2.332 | -0.605 | -0.371 |
| 2.349911304885158 | -2.535 | -0.611 | -0.374 |
| 2.353052897538748 | -2.882 | -0.617 | -0.377 |
| 2.356194490192337 | -16.251 | -0.623 | -0.38 |
| 2.359336082845927 | -2.882 | -0.63 | -0.383 |
| 2.362477675499516 | -2.535 | -0.636 | -0.387 |
| 2.365619268153106 | -2.332 | -0.643 | -0.39 |
| 2.368760860806696 | -2.188 | -0.649 | -0.393 |
| 2.371902453460285 | -2.077 | -0.656 | -0.396 |
| 2.375044046113875 | -1.986 | -0.663 | -0.4 |
| 2.378185638767464 | -1.908 | -0.67 | -0.403 |
| 2.381327231421054 | -1.842 | -0.678 | -0.407 |
| 2.384468824074644 | -1.783 | -0.685 | -0.41 |
| 2.387610416728233 | -1.73 | -0.693 | -0.414 |
| 2.390752009381823 | -1.682 | -0.701 | -0.417 |
| 2.393893602035412 | -1.639 | -0.709 | -0.421 |
| 2.397035194689002 | -1.599 | -0.717 | -0.425 |
| 2.400176787342591 | -1.562 | -0.725 | -0.429 |
| 2.403318379996181 | -1.527 | -0.734 | -0.432 |
| 2.406459972649771 | -1.495 | -0.743 | -0.436 |
| 2.40960156530336 | -1.464 | -0.752 | -0.44 |
| 2.41274315795695 | -1.436 | -0.761 | -0.444 |
| 2.41588475061054 | -1.409 | -0.771 | -0.448 |
| 2.419026343264129 | -1.383 | -0.781 | -0.453 |
| 2.422167935917719 | -1.359 | -0.791 | -0.457 |
| 2.425309528571308 | -1.335 | -0.802 | -0.461 |
| 2.428451121224898 | -1.313 | -0.813 | -0.465 |
| 2.431592713878488 | -1.292 | -0.824 | -0.47 |
| 2.434734306532077 | -1.271 | -0.835 | -0.474 |
| 2.437875899185667 | -1.251 | -0.847 | -0.479 |
| 2.441017491839256 | -1.232 | -0.86 | -0.484 |
| 2.444159084492846 | -1.214 | -0.873 | -0.489 |
| 2.447300677146435 | -1.196 | -0.886 | -0.493 |
| 2.450442269800025 | -1.179 | -0.901 | -0.498 |
| 2.453583862453615 | -1.163 | -0.915 | -0.503 |
| 2.456725455107204 | -1.147 | -0.93 | -0.509 |
| 2.459867047760794 | -1.131 | -0.947 | -0.514 |
| 2.463008640414384 | -1.116 | -0.963 | -0.519 |
| 2.466150233067973 | -1.102 | -0.981 | -0.525 |
| 2.469291825721563 | -1.088 | -1 | -0.53 |
| 2.472433418375152 | -1.074 | -1.02 | -0.536 |
| 2.475575011028742 | -1.06 | -1.041 | -0.542 |
| 2.478716603682332 | -1.047 | -1.063 | -0.548 |
| 2.481858196335921 | -1.034 | -1.087 | -0.554 |
| 2.48499978898951 | -1.022 | -1.112 | -0.561 |
| 2.4881413816431 | -1.01 | -1.14 | -0.567 |
| 2.49128297429669 | -0.998 | -1.17 | -0.574 |
| 2.49442456695028 | -0.986 | -1.203 | -0.581 |
| 2.497566159603869 | -0.975 | -1.24 | -0.588 |
| 2.500707752257458 | -0.964 | -1.281 | -0.595 |
| 2.503849344911048 | -0.953 | -1.327 | -0.602 |
| 2.506990937564638 | -0.942 | -1.38 | -0.61 |
| 2.510132530218228 | -0.932 | -1.444 | -0.618 |
| 2.513274122871817 | -0.921 | -1.521 | -0.626 |
| 2.516415715525407 | -0.911 | -1.619 | -0.634 |
| 2.519557308178996 | -0.901 | -1.757 | -0.643 |
| 2.522698900832586 | -0.892 | -1.988 | -0.652 |
| 2.525840493486176 | -0.882 | -2.881 | -0.661 |
| 2.528982086139765 | -0.873 | -2.048 | -0.671 |
| 2.532123678793355 | -0.864 | -1.787 | -0.68 |
| 2.535265271446944 | -0.855 | -1.638 | -0.691 |
| 2.538406864100534 | -0.846 | -1.533 | -0.701 |
| 2.541548456754124 | -0.837 | -1.452 | -0.713 |
| 2.544690049407713 | -0.828 | -1.386 | -0.724 |
| 2.547831642061302 | -0.82 | -1.33 | -0.736 |
| 2.550973234714892 | -0.812 | -1.282 | -0.749 |
| 2.554114827368482 | -0.803 | -1.24 | -0.763 |
| 2.557256420022072 | -0.795 | -1.202 | -0.777 |
| 2.560398012675661 | -0.787 | -1.167 | -0.792 |
| 2.563539605329251 | -0.779 | -1.136 | -0.807 |
| 2.56668119798284 | -0.772 | -1.107 | -0.824 |
| 2.56982279063643 | -0.764 | -1.08 | -0.842 |
| 2.57296438329002 | -0.757 | -1.055 | -0.861 |
| 2.576105975943609 | -0.749 | -1.032 | -0.881 |
| 2.579247568597199 | -0.742 | -1.01 | -0.903 |
| 2.582389161250788 | -0.735 | -0.989 | -0.927 |
| 2.585530753904377 | -0.727 | -0.969 | -0.953 |
| 2.588672346557967 | -0.72 | -0.951 | -0.982 |
| 2.591813939211557 | -0.713 | -0.933 | -1.014 |
| 2.594955531865147 | -0.707 | -0.916 | -1.051 |
| 2.598097124518736 | -0.7 | -0.9 | -1.093 |
| 2.601238717172326 | -0.693 | -0.884 | -1.142 |
| 2.604380309825915 | -0.686 | -0.869 | -1.201 |
| 2.607521902479505 | -0.68 | -0.855 | -1.276 |
| 2.610663495133095 | -0.673 | -0.841 | -1.379 |
| 2.613805087786684 | -0.667 | -0.828 | -1.54 |
| 2.616946680440274 | -0.661 | -0.815 | -3 |
| 2.620088273093863 | -0.654 | -0.802 | -1.739 |
| 2.623229865747452 | -0.648 | -0.79 | -1.474 |
| 2.626371458401042 | -0.642 | -0.778 | -1.338 |
| 2.629513051054632 | -0.636 | -0.767 | -1.245 |
| 2.632654643708222 | -0.63 | -0.756 | -1.175 |
| 2.635796236361811 | -0.624 | -0.745 | -1.118 |
| 2.638937829015401 | -0.618 | -0.735 | -1.071 |
| 2.642079421668991 | -0.612 | -0.724 | -1.03 |
| 2.64522101432258 | -0.606 | -0.714 | -0.994 |
| 2.64836260697617 | -0.601 | -0.705 | -0.962 |
| 2.651504199629759 | -0.595 | -0.695 | -0.933 |
| 2.654645792283349 | -0.589 | -0.686 | -0.907 |
| 2.657787384936938 | -0.584 | -0.677 | -0.882 |
| 2.660928977590528 | -0.578 | -0.668 | -0.86 |
| 2.664070570244118 | -0.573 | -0.659 | -0.839 |
| 2.667212162897707 | -0.567 | -0.651 | -0.819 |
| 2.670353755551297 | -0.562 | -0.643 | -0.801 |
| 2.673495348204887 | -0.557 | -0.635 | -0.783 |
| 2.676636940858476 | -0.551 | -0.627 | -0.767 |
| 2.679778533512066 | -0.546 | -0.619 | -0.751 |
| 2.682920126165655 | -0.541 | -0.611 | -0.736 |
| 2.686061718819245 | -0.536 | -0.603 | -0.722 |
| 2.689203311472835 | -0.531 | -0.596 | -0.709 |
| 2.692344904126424 | -0.526 | -0.589 | -0.696 |
| 2.695486496780014 | -0.521 | -0.582 | -0.683 |
| 2.698628089433603 | -0.516 | -0.574 | -0.671 |
| 2.701769682087193 | -0.511 | -0.568 | -0.659 |
| 2.704911274740782 | -0.506 | -0.561 | -0.648 |
| 2.708052867394372 | -0.501 | -0.554 | -0.637 |
| 2.711194460047962 | -0.496 | -0.547 | -0.627 |
| 2.714336052701551 | -0.491 | -0.541 | -0.616 |
| 2.717477645355141 | -0.487 | -0.534 | -0.607 |
| 2.720619238008731 | -0.482 | -0.528 | -0.597 |
| 2.72376083066232 | -0.477 | -0.522 | -0.588 |
| 2.72690242331591 | -0.473 | -0.516 | -0.579 |
| 2.730044015969499 | -0.468 | -0.51 | -0.57 |
| 2.733185608623089 | -0.463 | -0.504 | -0.561 |
| 2.736327201276678 | -0.459 | -0.498 | -0.553 |
| 2.739468793930268 | -0.454 | -0.492 | -0.544 |
| 2.742610386583858 | -0.45 | -0.486 | -0.536 |
| 2.745751979237447 | -0.445 | -0.48 | -0.529 |
| 2.748893571891036 | -0.441 | -0.475 | -0.521 |
| 2.752035164544627 | -0.436 | -0.469 | -0.513 |
| 2.755176757198216 | -0.432 | -0.464 | -0.506 |
| 2.758318349851806 | -0.427 | -0.458 | -0.499 |
| 2.761459942505395 | -0.423 | -0.453 | -0.492 |
| 2.764601535158985 | -0.419 | -0.447 | -0.485 |
| 2.767743127812574 | -0.415 | -0.442 | -0.478 |
| 2.770884720466164 | -0.41 | -0.437 | -0.471 |
| 2.774026313119754 | -0.406 | -0.432 | -0.465 |
| 2.777167905773343 | -0.402 | -0.427 | -0.458 |
| 2.780309498426932 | -0.398 | -0.422 | -0.452 |
| 2.783451091080522 | -0.393 | -0.417 | -0.446 |
| 2.786592683734112 | -0.389 | -0.412 | -0.44 |
| 2.789734276387701 | -0.385 | -0.407 | -0.434 |
| 2.792875869041291 | -0.381 | -0.402 | -0.428 |
| 2.796017461694881 | -0.377 | -0.397 | -0.422 |
| 2.79915905434847 | -0.373 | -0.392 | -0.416 |
| 2.80230064700206 | -0.369 | -0.388 | -0.411 |
| 2.80544223965565 | -0.365 | -0.383 | -0.405 |
| 2.808583832309239 | -0.361 | -0.378 | -0.399 |
| 2.811725424962829 | -0.357 | -0.374 | -0.394 |
| 2.814867017616419 | -0.353 | -0.369 | -0.389 |
| 2.818008610270008 | -0.349 | -0.365 | -0.383 |
| 2.821150202923598 | -0.345 | -0.36 | -0.378 |
| 2.824291795577187 | -0.341 | -0.356 | -0.373 |
| 2.827433388230777 | -0.337 | -0.351 | -0.368 |
| 2.830574980884366 | -0.333 | -0.347 | -0.363 |
| 2.833716573537956 | -0.329 | -0.342 | -0.358 |
| 2.836858166191546 | -0.326 | -0.338 | -0.353 |
| 2.839999758845135 | -0.322 | -0.334 | -0.348 |
| 2.843141351498725 | -0.318 | -0.33 | -0.343 |
| 2.846282944152314 | -0.314 | -0.325 | -0.338 |
| 2.849424536805904 | -0.31 | -0.321 | -0.334 |
| 2.852566129459494 | -0.307 | -0.317 | -0.329 |
| 2.855707722113083 | -0.303 | -0.313 | -0.324 |
| 2.858849314766673 | -0.299 | -0.309 | -0.32 |
| 2.861990907420262 | -0.295 | -0.305 | -0.315 |
| 2.865132500073852 | -0.292 | -0.301 | -0.311 |
| 2.868274092727442 | -0.288 | -0.297 | -0.306 |
| 2.871415685381031 | -0.284 | -0.293 | -0.302 |
| 2.874557278034621 | -0.281 | -0.289 | -0.297 |
| 2.87769887068821 | -0.277 | -0.285 | -0.293 |
| 2.8808404633418 | -0.273 | -0.281 | -0.289 |
| 2.88398205599539 | -0.27 | -0.277 | -0.284 |
| 2.88712364864898 | -0.266 | -0.273 | -0.28 |
| 2.890265241302569 | -0.263 | -0.269 | -0.276 |
| 2.893406833956158 | -0.259 | -0.265 | -0.272 |
| 2.896548426609748 | -0.255 | -0.261 | -0.268 |
| 2.899690019263338 | -0.252 | -0.258 | -0.264 |
| 2.902831611916927 | -0.248 | -0.254 | -0.26 |
| 2.905973204570517 | -0.245 | -0.25 | -0.256 |
| 2.909114797224106 | -0.241 | -0.246 | -0.252 |
| 2.912256389877696 | -0.238 | -0.243 | -0.248 |
| 2.915397982531286 | -0.234 | -0.239 | -0.244 |
| 2.918539575184875 | -0.231 | -0.235 | -0.24 |
| 2.921681167838465 | -0.227 | -0.231 | -0.236 |
| 2.924822760492054 | -0.224 | -0.228 | -0.232 |
| 2.927964353145644 | -0.22 | -0.224 | -0.228 |
| 2.931105945799234 | -0.217 | -0.221 | -0.224 |
| 2.934247538452823 | -0.214 | -0.217 | -0.22 |
| 2.937389131106413 | -0.21 | -0.213 | -0.217 |
| 2.940530723760002 | -0.207 | -0.21 | -0.213 |
| 2.943672316413592 | -0.203 | -0.206 | -0.209 |
| 2.946813909067182 | -0.2 | -0.203 | -0.206 |
| 2.949955501720771 | -0.197 | -0.199 | -0.202 |
| 2.953097094374361 | -0.193 | -0.196 | -0.198 |
| 2.95623868702795 | -0.19 | -0.192 | -0.195 |
| 2.95938027968154 | -0.186 | -0.189 | -0.191 |
| 2.96252187233513 | -0.183 | -0.185 | -0.187 |
| 2.965663464988719 | -0.18 | -0.182 | -0.184 |
| 2.968805057642309 | -0.176 | -0.178 | -0.18 |
| 2.971946650295898 | -0.173 | -0.175 | -0.177 |
| 2.975088242949488 | -0.17 | -0.171 | -0.173 |
| 2.978229835603078 | -0.166 | -0.168 | -0.17 |
| 2.981371428256667 | -0.163 | -0.165 | -0.166 |
| 2.984513020910257 | -0.16 | -0.161 | -0.163 |
| 2.987654613563846 | -0.156 | -0.158 | -0.159 |
| 2.990796206217436 | -0.153 | -0.154 | -0.156 |
| 2.993937798871025 | -0.15 | -0.151 | -0.152 |
| 2.997079391524615 | -0.147 | -0.148 | -0.149 |
| 3.000220984178205 | -0.143 | -0.144 | -0.145 |
| 3.003362576831794 | -0.14 | -0.141 | -0.142 |
| 3.006504169485384 | -0.137 | -0.138 | -0.139 |
| 3.009645762138974 | -0.134 | -0.134 | -0.135 |
| 3.012787354792563 | -0.13 | -0.131 | -0.132 |
| 3.015928947446153 | -0.127 | -0.128 | -0.128 |
| 3.019070540099742 | -0.124 | -0.124 | -0.125 |
| 3.022212132753332 | -0.121 | -0.121 | -0.122 |
| 3.025353725406922 | -0.117 | -0.118 | -0.118 |
| 3.028495318060511 | -0.114 | -0.115 | -0.115 |
| 3.031636910714101 | -0.111 | -0.111 | -0.112 |
| 3.03477850336769 | -0.108 | -0.108 | -0.108 |
| 3.03792009602128 | -0.104 | -0.105 | -0.105 |
| 3.04106168867487 | -0.101 | -0.102 | -0.102 |
| 3.04420328132846 | -0.098 | -0.098 | -0.099 |
| 3.047344873982049 | -0.095 | -0.095 | -0.095 |
| 3.050486466635638 | -0.092 | -0.092 | -0.092 |
| 3.053628059289228 | -0.088 | -0.089 | -0.089 |
| 3.056769651942818 | -0.085 | -0.085 | -0.086 |
| 3.059911244596407 | -0.082 | -0.082 | -0.082 |
| 3.063052837249997 | -0.079 | -0.079 | -0.079 |
| 3.066194429903586 | -0.076 | -0.076 | -0.076 |
| 3.069336022557176 | -0.073 | -0.073 | -0.073 |
| 3.072477615210766 | -0.069 | -0.069 | -0.07 |
| 3.075619207864355 | -0.066 | -0.066 | -0.066 |
| 3.078760800517945 | -0.063 | -0.063 | -0.063 |
| 3.081902393171534 | -0.06 | -0.06 | -0.06 |
| 3.085043985825124 | -0.057 | -0.057 | -0.057 |
| 3.088185578478713 | -0.054 | -0.054 | -0.054 |
| 3.091327171132303 | -0.05 | -0.05 | -0.05 |
| 3.094468763785893 | -0.047 | -0.047 | -0.047 |
| 3.097610356439482 | -0.044 | -0.044 | -0.044 |
| 3.100751949093072 | -0.041 | -0.041 | -0.041 |
| 3.103893541746661 | -0.038 | -0.038 | -0.038 |
| 3.107035134400251 | -0.035 | -0.035 | -0.035 |
| 3.110176727053841 | -0.031 | -0.031 | -0.031 |
| 3.11331831970743 | -0.028 | -0.028 | -0.028 |
| 3.11645991236102 | -0.025 | -0.025 | -0.025 |
| 3.11960150501461 | -0.022 | -0.022 | -0.022 |
| 3.122743097668199 | -0.019 | -0.019 | -0.019 |
| 3.125884690321789 | -0.016 | -0.016 | -0.016 |
| 3.129026282975378 | -0.013 | -0.013 | -0.013 |
| 3.132167875628968 | -0.009 | -0.009 | -0.009 |
| 3.135309468282557 | -0.006 | -0.006 | -0.006 |
| 3.138451060936147 | -0.003 | -0.003 | -0.003 |
| 3.141592653589737 | 0 | 0 | 0 |
| 3.144734246243326 | 0.003 | 0.003 | 0.003 |
| 3.147875838896916 | 0.006 | 0.006 | 0.006 |
| 3.151017431550505 | 0.009 | 0.009 | 0.009 |
| 3.154159024204095 | 0.013 | 0.013 | 0.013 |
| 3.157300616857685 | 0.016 | 0.016 | 0.016 |
| 3.160442209511274 | 0.019 | 0.019 | 0.019 |
| 3.163583802164864 | 0.022 | 0.022 | 0.022 |
| 3.166725394818453 | 0.025 | 0.025 | 0.025 |
| 3.169866987472043 | 0.028 | 0.028 | 0.028 |
| 3.173008580125633 | 0.031 | 0.031 | 0.031 |
| 3.176150172779222 | 0.035 | 0.035 | 0.035 |
| 3.179291765432812 | 0.038 | 0.038 | 0.038 |
| 3.182433358086401 | 0.041 | 0.041 | 0.041 |
| 3.185574950739991 | 0.044 | 0.044 | 0.044 |
| 3.188716543393581 | 0.047 | 0.047 | 0.047 |
| 3.19185813604717 | 0.05 | 0.05 | 0.05 |
| 3.19499972870076 | 0.054 | 0.054 | 0.054 |
| 3.198141321354349 | 0.057 | 0.057 | 0.057 |
| 3.20128291400794 | 0.06 | 0.06 | 0.06 |
| 3.204424506661528 | 0.063 | 0.063 | 0.063 |
| 3.207566099315118 | 0.066 | 0.066 | 0.066 |
| 3.210707691968708 | 0.069 | 0.069 | 0.07 |
| 3.213849284622297 | 0.073 | 0.073 | 0.073 |
| 3.216990877275887 | 0.076 | 0.076 | 0.076 |
| 3.220132469929476 | 0.079 | 0.079 | 0.079 |
| 3.223274062583066 | 0.082 | 0.082 | 0.082 |
| 3.226415655236656 | 0.085 | 0.085 | 0.086 |
| 3.229557247890245 | 0.088 | 0.089 | 0.089 |
| 3.232698840543835 | 0.092 | 0.092 | 0.092 |
| 3.235840433197425 | 0.095 | 0.095 | 0.095 |
| 3.238982025851014 | 0.098 | 0.098 | 0.099 |
| 3.242123618504604 | 0.101 | 0.102 | 0.102 |
| 3.245265211158193 | 0.104 | 0.105 | 0.105 |
| 3.248406803811783 | 0.108 | 0.108 | 0.108 |
| 3.251548396465373 | 0.111 | 0.111 | 0.112 |
| 3.254689989118962 | 0.114 | 0.115 | 0.115 |
| 3.257831581772551 | 0.117 | 0.118 | 0.118 |
| 3.260973174426141 | 0.121 | 0.121 | 0.122 |
| 3.26411476707973 | 0.124 | 0.124 | 0.125 |
| 3.267256359733321 | 0.127 | 0.128 | 0.128 |
| 3.27039795238691 | 0.13 | 0.131 | 0.132 |
| 3.2735395450405 | 0.134 | 0.134 | 0.135 |
| 3.276681137694089 | 0.137 | 0.138 | 0.139 |
| 3.279822730347679 | 0.14 | 0.141 | 0.142 |
| 3.282964323001269 | 0.143 | 0.144 | 0.145 |
| 3.286105915654858 | 0.147 | 0.148 | 0.149 |
| 3.289247508308448 | 0.15 | 0.151 | 0.152 |
| 3.292389100962037 | 0.153 | 0.154 | 0.156 |
| 3.295530693615627 | 0.156 | 0.158 | 0.159 |
| 3.298672286269217 | 0.16 | 0.161 | 0.163 |
| 3.301813878922806 | 0.163 | 0.165 | 0.166 |
| 3.304955471576396 | 0.166 | 0.168 | 0.17 |
| 3.308097064229985 | 0.17 | 0.171 | 0.173 |
| 3.311238656883575 | 0.173 | 0.175 | 0.177 |
| 3.314380249537165 | 0.176 | 0.178 | 0.18 |
| 3.317521842190754 | 0.18 | 0.182 | 0.184 |
| 3.320663434844344 | 0.183 | 0.185 | 0.187 |
| 3.323805027497933 | 0.186 | 0.189 | 0.191 |
| 3.326946620151523 | 0.19 | 0.192 | 0.195 |
| 3.330088212805113 | 0.193 | 0.196 | 0.198 |
| 3.333229805458702 | 0.197 | 0.199 | 0.202 |
| 3.336371398112292 | 0.2 | 0.203 | 0.206 |
| 3.339512990765881 | 0.203 | 0.206 | 0.209 |
| 3.342654583419471 | 0.207 | 0.21 | 0.213 |
| 3.345796176073061 | 0.21 | 0.213 | 0.217 |
| 3.34893776872665 | 0.214 | 0.217 | 0.22 |
| 3.35207936138024 | 0.217 | 0.221 | 0.224 |
| 3.355220954033829 | 0.22 | 0.224 | 0.228 |
| 3.358362546687419 | 0.224 | 0.228 | 0.232 |
| 3.361504139341009 | 0.227 | 0.231 | 0.236 |
| 3.364645731994598 | 0.231 | 0.235 | 0.24 |
| 3.367787324648188 | 0.234 | 0.239 | 0.244 |
| 3.370928917301777 | 0.238 | 0.243 | 0.248 |
| 3.374070509955367 | 0.241 | 0.246 | 0.252 |
| 3.377212102608956 | 0.245 | 0.25 | 0.256 |
| 3.380353695262546 | 0.248 | 0.254 | 0.26 |
| 3.383495287916136 | 0.252 | 0.258 | 0.264 |
| 3.386636880569725 | 0.255 | 0.261 | 0.268 |
| 3.389778473223315 | 0.259 | 0.265 | 0.272 |
| 3.392920065876904 | 0.263 | 0.269 | 0.276 |
| 3.396061658530494 | 0.266 | 0.273 | 0.28 |
| 3.399203251184084 | 0.27 | 0.277 | 0.284 |
| 3.402344843837673 | 0.273 | 0.281 | 0.289 |
| 3.405486436491263 | 0.277 | 0.285 | 0.293 |
| 3.408628029144852 | 0.281 | 0.289 | 0.297 |
| 3.411769621798442 | 0.284 | 0.293 | 0.302 |
| 3.414911214452032 | 0.288 | 0.297 | 0.306 |
| 3.418052807105621 | 0.292 | 0.301 | 0.311 |
| 3.421194399759211 | 0.295 | 0.305 | 0.315 |
| 3.4243359924128 | 0.299 | 0.309 | 0.32 |
| 3.42747758506639 | 0.303 | 0.313 | 0.324 |
| 3.43061917771998 | 0.307 | 0.317 | 0.329 |
| 3.433760770373569 | 0.31 | 0.321 | 0.334 |
| 3.436902363027159 | 0.314 | 0.325 | 0.338 |
| 3.440043955680748 | 0.318 | 0.33 | 0.343 |
| 3.443185548334338 | 0.322 | 0.334 | 0.348 |
| 3.446327140987927 | 0.326 | 0.338 | 0.353 |
| 3.449468733641517 | 0.329 | 0.342 | 0.358 |
| 3.452610326295107 | 0.333 | 0.347 | 0.363 |
| 3.455751918948696 | 0.337 | 0.351 | 0.368 |
| 3.458893511602286 | 0.341 | 0.356 | 0.373 |
| 3.462035104255876 | 0.345 | 0.36 | 0.378 |
| 3.465176696909465 | 0.349 | 0.365 | 0.383 |
| 3.468318289563055 | 0.353 | 0.369 | 0.389 |
| 3.471459882216644 | 0.357 | 0.374 | 0.394 |
| 3.474601474870234 | 0.361 | 0.378 | 0.399 |
| 3.477743067523824 | 0.365 | 0.383 | 0.405 |
| 3.480884660177413 | 0.369 | 0.388 | 0.411 |
| 3.484026252831002 | 0.373 | 0.392 | 0.416 |
| 3.487167845484592 | 0.377 | 0.397 | 0.422 |
| 3.490309438138182 | 0.381 | 0.402 | 0.428 |
| 3.493451030791772 | 0.385 | 0.407 | 0.434 |
| 3.496592623445361 | 0.389 | 0.412 | 0.44 |
| 3.499734216098951 | 0.393 | 0.417 | 0.446 |
| 3.50287580875254 | 0.398 | 0.422 | 0.452 |
| 3.50601740140613 | 0.402 | 0.427 | 0.458 |
| 3.50915899405972 | 0.406 | 0.432 | 0.465 |
| 3.512300586713309 | 0.41 | 0.437 | 0.471 |
| 3.515442179366899 | 0.415 | 0.442 | 0.478 |
| 3.518583772020488 | 0.419 | 0.447 | 0.485 |
| 3.521725364674078 | 0.423 | 0.453 | 0.492 |
| 3.524866957327668 | 0.427 | 0.458 | 0.499 |
| 3.528008549981257 | 0.432 | 0.464 | 0.506 |
| 3.531150142634847 | 0.436 | 0.469 | 0.513 |
| 3.534291735288436 | 0.441 | 0.475 | 0.521 |
| 3.537433327942026 | 0.445 | 0.48 | 0.529 |
| 3.540574920595616 | 0.45 | 0.486 | 0.536 |
| 3.543716513249205 | 0.454 | 0.492 | 0.544 |
| 3.546858105902795 | 0.459 | 0.498 | 0.553 |
| 3.549999698556384 | 0.463 | 0.504 | 0.561 |
| 3.553141291209974 | 0.468 | 0.51 | 0.57 |
| 3.556282883863564 | 0.473 | 0.516 | 0.579 |
| 3.559424476517153 | 0.477 | 0.522 | 0.588 |
| 3.562566069170743 | 0.482 | 0.528 | 0.597 |
| 3.565707661824332 | 0.487 | 0.534 | 0.607 |
| 3.568849254477922 | 0.491 | 0.541 | 0.616 |
| 3.571990847131511 | 0.496 | 0.547 | 0.627 |
| 3.575132439785101 | 0.501 | 0.554 | 0.637 |
| 3.578274032438691 | 0.506 | 0.561 | 0.648 |
| 3.58141562509228 | 0.511 | 0.568 | 0.659 |
| 3.58455721774587 | 0.516 | 0.574 | 0.671 |
| 3.58769881039946 | 0.521 | 0.582 | 0.683 |
| 3.590840403053049 | 0.526 | 0.589 | 0.696 |
| 3.593981995706639 | 0.531 | 0.596 | 0.709 |
| 3.597123588360228 | 0.536 | 0.603 | 0.722 |
| 3.600265181013818 | 0.541 | 0.611 | 0.736 |
| 3.603406773667407 | 0.546 | 0.619 | 0.751 |
| 3.606548366320997 | 0.551 | 0.627 | 0.767 |
| 3.609689958974587 | 0.557 | 0.635 | 0.783 |
| 3.612831551628176 | 0.562 | 0.643 | 0.801 |
| 3.615973144281766 | 0.567 | 0.651 | 0.819 |
| 3.619114736935355 | 0.573 | 0.659 | 0.839 |
| 3.622256329588945 | 0.578 | 0.668 | 0.86 |
| 3.625397922242534 | 0.584 | 0.677 | 0.882 |
| 3.628539514896124 | 0.589 | 0.686 | 0.907 |
| 3.631681107549714 | 0.595 | 0.695 | 0.933 |
| 3.634822700203303 | 0.601 | 0.705 | 0.962 |
| 3.637964292856893 | 0.606 | 0.714 | 0.994 |
| 3.641105885510483 | 0.612 | 0.724 | 1.03 |
| 3.644247478164072 | 0.618 | 0.735 | 1.071 |
| 3.647389070817662 | 0.624 | 0.745 | 1.118 |
| 3.650530663471251 | 0.63 | 0.756 | 1.175 |
| 3.653672256124841 | 0.636 | 0.767 | 1.245 |
| 3.656813848778431 | 0.642 | 0.778 | 1.338 |
| 3.65995544143202 | 0.648 | 0.79 | 1.474 |
| 3.66309703408561 | 0.654 | 0.802 | 1.739 |
| 3.666238626739199 | 0.661 | 0.815 | 3 |
| 3.66938021939279 | 0.667 | 0.828 | 1.54 |
| 3.672521812046378 | 0.673 | 0.841 | 1.379 |
| 3.675663404699968 | 0.68 | 0.855 | 1.276 |
| 3.678804997353558 | 0.686 | 0.869 | 1.201 |
| 3.681946590007147 | 0.693 | 0.884 | 1.142 |
| 3.685088182660737 | 0.7 | 0.9 | 1.093 |
| 3.688229775314326 | 0.707 | 0.916 | 1.051 |
| 3.691371367967916 | 0.713 | 0.933 | 1.014 |
| 3.694512960621506 | 0.72 | 0.951 | 0.982 |
| 3.697654553275095 | 0.727 | 0.969 | 0.953 |
| 3.700796145928685 | 0.735 | 0.989 | 0.927 |
| 3.703937738582274 | 0.742 | 1.01 | 0.903 |
| 3.707079331235864 | 0.749 | 1.032 | 0.881 |
| 3.710220923889454 | 0.757 | 1.055 | 0.861 |
| 3.713362516543043 | 0.764 | 1.08 | 0.842 |
| 3.716504109196633 | 0.772 | 1.107 | 0.824 |
| 3.719645701850223 | 0.779 | 1.136 | 0.807 |
| 3.722787294503812 | 0.787 | 1.167 | 0.792 |
| 3.725928887157402 | 0.795 | 1.202 | 0.777 |
| 3.729070479810991 | 0.803 | 1.24 | 0.763 |
| 3.732212072464581 | 0.812 | 1.282 | 0.749 |
| 3.735353665118171 | 0.82 | 1.33 | 0.736 |
| 3.73849525777176 | 0.828 | 1.386 | 0.724 |
| 3.74163685042535 | 0.837 | 1.452 | 0.713 |
| 3.744778443078939 | 0.846 | 1.533 | 0.701 |
| 3.747920035732529 | 0.855 | 1.638 | 0.691 |
| 3.751061628386119 | 0.864 | 1.787 | 0.68 |
| 3.754203221039708 | 0.873 | 2.048 | 0.671 |
| 3.757344813693298 | 0.882 | 2.881 | 0.661 |
| 3.760486406346887 | 0.892 | 1.988 | 0.652 |
| 3.763627999000477 | 0.901 | 1.757 | 0.643 |
| 3.766769591654067 | 0.911 | 1.619 | 0.634 |
| 3.769911184307656 | 0.921 | 1.521 | 0.626 |
| 3.773052776961246 | 0.932 | 1.444 | 0.618 |
| 3.776194369614835 | 0.942 | 1.38 | 0.61 |
| 3.779335962268425 | 0.953 | 1.327 | 0.602 |
| 3.782477554922014 | 0.964 | 1.281 | 0.595 |
| 3.785619147575604 | 0.975 | 1.24 | 0.588 |
| 3.788760740229193 | 0.986 | 1.203 | 0.581 |
| 3.791902332882783 | 0.998 | 1.17 | 0.574 |
| 3.795043925536373 | 1.01 | 1.14 | 0.567 |
| 3.798185518189962 | 1.022 | 1.112 | 0.561 |
| 3.801327110843552 | 1.034 | 1.087 | 0.554 |
| 3.804468703497142 | 1.047 | 1.063 | 0.548 |
| 3.807610296150731 | 1.06 | 1.041 | 0.542 |
| 3.810751888804321 | 1.074 | 1.02 | 0.536 |
| 3.813893481457911 | 1.088 | 1 | 0.53 |
| 3.8170350741115 | 1.102 | 0.981 | 0.525 |
| 3.82017666676509 | 1.116 | 0.963 | 0.519 |
| 3.823318259418679 | 1.131 | 0.947 | 0.514 |
| 3.826459852072269 | 1.147 | 0.93 | 0.509 |
| 3.829601444725859 | 1.163 | 0.915 | 0.503 |
| 3.832743037379448 | 1.179 | 0.901 | 0.498 |
| 3.835884630033038 | 1.196 | 0.886 | 0.493 |
| 3.839026222686627 | 1.214 | 0.873 | 0.489 |
| 3.842167815340217 | 1.232 | 0.86 | 0.484 |
| 3.845309407993807 | 1.251 | 0.847 | 0.479 |
| 3.848451000647396 | 1.271 | 0.835 | 0.474 |
| 3.851592593300986 | 1.292 | 0.824 | 0.47 |
| 3.854734185954575 | 1.313 | 0.813 | 0.465 |
| 3.857875778608165 | 1.335 | 0.802 | 0.461 |
| 3.861017371261755 | 1.359 | 0.791 | 0.457 |
| 3.864158963915344 | 1.383 | 0.781 | 0.453 |
| 3.867300556568933 | 1.409 | 0.771 | 0.448 |
| 3.870442149222523 | 1.436 | 0.761 | 0.444 |
| 3.873583741876112 | 1.464 | 0.752 | 0.44 |
| 3.876725334529703 | 1.495 | 0.743 | 0.436 |
| 3.879866927183292 | 1.527 | 0.734 | 0.432 |
| 3.883008519836882 | 1.562 | 0.725 | 0.429 |
| 3.886150112490471 | 1.599 | 0.717 | 0.425 |
| 3.889291705144061 | 1.639 | 0.709 | 0.421 |
| 3.892433297797651 | 1.682 | 0.701 | 0.417 |
| 3.89557489045124 | 1.73 | 0.693 | 0.414 |
| 3.89871648310483 | 1.783 | 0.685 | 0.41 |
| 3.901858075758419 | 1.842 | 0.678 | 0.407 |
| 3.904999668412009 | 1.908 | 0.67 | 0.403 |
| 3.908141261065598 | 1.986 | 0.663 | 0.4 |
| 3.911282853719188 | 2.077 | 0.656 | 0.396 |
| 3.914424446372778 | 2.188 | 0.649 | 0.393 |
| 3.917566039026367 | 2.332 | 0.643 | 0.39 |
| 3.920707631679957 | 2.535 | 0.636 | 0.387 |
| 3.923849224333547 | 2.882 | 0.63 | 0.383 |
| 3.926990816987136 | 14.94 | 0.623 | 0.38 |
| 3.930132409640726 | 2.882 | 0.617 | 0.377 |
| 3.933274002294315 | 2.535 | 0.611 | 0.374 |
| 3.936415594947905 | 2.332 | 0.605 | 0.371 |
| 3.939557187601495 | 2.188 | 0.599 | 0.368 |
| 3.942698780255084 | 2.077 | 0.593 | 0.365 |
| 3.945840372908674 | 1.986 | 0.588 | 0.362 |
| 3.948981965562263 | 1.908 | 0.582 | 0.359 |
| 3.952123558215853 | 1.842 | 0.576 | 0.356 |
| 3.955265150869442 | 1.783 | 0.571 | 0.353 |
| 3.958406743523032 | 1.73 | 0.566 | 0.351 |
| 3.961548336176622 | 1.682 | 0.56 | 0.348 |
| 3.964689928830211 | 1.639 | 0.555 | 0.345 |
| 3.967831521483801 | 1.599 | 0.55 | 0.342 |
| 3.97097311413739 | 1.562 | 0.545 | 0.34 |
| 3.97411470679098 | 1.527 | 0.54 | 0.337 |
| 3.97725629944457 | 1.495 | 0.535 | 0.334 |
| 3.98039789209816 | 1.464 | 0.531 | 0.332 |
| 3.983539484751749 | 1.436 | 0.526 | 0.329 |
| 3.986681077405338 | 1.409 | 0.521 | 0.327 |
| 3.989822670058928 | 1.383 | 0.517 | 0.324 |
| 3.992964262712517 | 1.359 | 0.512 | 0.322 |
| 3.996105855366107 | 1.335 | 0.508 | 0.319 |
| 3.999247448019697 | 1.313 | 0.503 | 0.317 |
| 4.002389040673287 | 1.292 | 0.499 | 0.314 |
| 4.005530633326877 | 1.271 | 0.494 | 0.312 |
| 4.008672225980466 | 1.251 | 0.49 | 0.309 |
| 4.011813818634056 | 1.232 | 0.486 | 0.307 |
| 4.014955411287645 | 1.214 | 0.482 | 0.305 |
| 4.018097003941234 | 1.196 | 0.478 | 0.302 |
| 4.021238596594824 | 1.179 | 0.474 | 0.3 |
| 4.024380189248414 | 1.163 | 0.47 | 0.298 |
| 4.027521781902004 | 1.147 | 0.466 | 0.296 |
| 4.030663374555593 | 1.131 | 0.462 | 0.293 |
| 4.033804967209183 | 1.116 | 0.458 | 0.291 |
| 4.036946559862773 | 1.102 | 0.454 | 0.289 |
| 4.040088152516362 | 1.088 | 0.45 | 0.287 |
| 4.043229745169951 | 1.074 | 0.447 | 0.285 |
| 4.046371337823541 | 1.06 | 0.443 | 0.283 |
| 4.049512930477131 | 1.047 | 0.439 | 0.28 |
| 4.05265452313072 | 1.034 | 0.436 | 0.278 |
| 4.05579611578431 | 1.022 | 0.432 | 0.276 |
| 4.0589377084379 | 1.01 | 0.429 | 0.274 |
| 4.062079301091489 | 0.998 | 0.425 | 0.272 |
| 4.065220893745079 | 0.986 | 0.422 | 0.27 |
| 4.068362486398668 | 0.975 | 0.418 | 0.268 |
| 4.071504079052258 | 0.964 | 0.415 | 0.266 |
| 4.074645671705848 | 0.953 | 0.411 | 0.264 |
| 4.077787264359437 | 0.942 | 0.408 | 0.262 |
| 4.080928857013027 | 0.932 | 0.405 | 0.26 |
| 4.084070449666616 | 0.921 | 0.401 | 0.258 |
| 4.087212042320206 | 0.911 | 0.398 | 0.256 |
| 4.090353634973795 | 0.901 | 0.395 | 0.254 |
| 4.093495227627385 | 0.892 | 0.392 | 0.252 |
| 4.096636820280975 | 0.882 | 0.389 | 0.25 |
| 4.099778412934564 | 0.873 | 0.386 | 0.249 |
| 4.102920005588154 | 0.864 | 0.382 | 0.247 |
| 4.106061598241744 | 0.855 | 0.379 | 0.245 |
| 4.109203190895333 | 0.846 | 0.376 | 0.243 |
| 4.112344783548923 | 0.837 | 0.373 | 0.241 |
| 4.115486376202512 | 0.828 | 0.37 | 0.239 |
| 4.118627968856102 | 0.82 | 0.367 | 0.238 |
| 4.121769561509692 | 0.812 | 0.364 | 0.236 |
| 4.124911154163281 | 0.803 | 0.361 | 0.234 |
| 4.128052746816871 | 0.795 | 0.359 | 0.232 |
| 4.13119433947046 | 0.787 | 0.356 | 0.23 |
| 4.13433593212405 | 0.779 | 0.353 | 0.229 |
| 4.13747752477764 | 0.772 | 0.35 | 0.227 |
| 4.14061911743123 | 0.764 | 0.347 | 0.225 |
| 4.143760710084818 | 0.757 | 0.344 | 0.224 |
| 4.146902302738408 | 0.749 | 0.342 | 0.222 |
| 4.150043895391998 | 0.742 | 0.339 | 0.22 |
| 4.153185488045588 | 0.735 | 0.336 | 0.218 |
| 4.156327080699177 | 0.727 | 0.333 | 0.217 |
| 4.159468673352766 | 0.72 | 0.331 | 0.215 |
| 4.162610266006356 | 0.713 | 0.328 | 0.213 |
| 4.165751858659946 | 0.707 | 0.325 | 0.212 |
| 4.168893451313535 | 0.7 | 0.323 | 0.21 |
| 4.172035043967125 | 0.693 | 0.32 | 0.209 |
| 4.175176636620715 | 0.686 | 0.318 | 0.207 |
| 4.178318229274304 | 0.68 | 0.315 | 0.205 |
| 4.181459821927894 | 0.673 | 0.312 | 0.204 |
| 4.184601414581484 | 0.667 | 0.31 | 0.202 |
| 4.187743007235073 | 0.661 | 0.307 | 0.201 |
| 4.190884599888663 | 0.654 | 0.305 | 0.199 |
| 4.194026192542252 | 0.648 | 0.302 | 0.197 |
| 4.197167785195842 | 0.642 | 0.3 | 0.196 |
| 4.200309377849432 | 0.636 | 0.297 | 0.194 |
| 4.203450970503021 | 0.63 | 0.295 | 0.193 |
| 4.206592563156611 | 0.624 | 0.293 | 0.191 |
| 4.2097341558102 | 0.618 | 0.29 | 0.19 |
| 4.21287574846379 | 0.612 | 0.288 | 0.188 |
| 4.21601734111738 | 0.606 | 0.285 | 0.187 |
| 4.21915893377097 | 0.601 | 0.283 | 0.185 |
| 4.222300526424559 | 0.595 | 0.281 | 0.184 |
| 4.225442119078148 | 0.589 | 0.278 | 0.182 |
| 4.228583711731738 | 0.584 | 0.276 | 0.181 |
| 4.231725304385327 | 0.578 | 0.274 | 0.179 |
| 4.234866897038917 | 0.573 | 0.271 | 0.178 |
| 4.238008489692506 | 0.567 | 0.269 | 0.176 |
| 4.241150082346096 | 0.562 | 0.267 | 0.175 |
| 4.244291674999685 | 0.557 | 0.264 | 0.174 |
| 4.247433267653276 | 0.551 | 0.262 | 0.172 |
| 4.250574860306865 | 0.546 | 0.26 | 0.171 |
| 4.253716452960455 | 0.541 | 0.258 | 0.169 |
| 4.256858045614044 | 0.536 | 0.256 | 0.168 |
| 4.259999638267634 | 0.531 | 0.253 | 0.166 |
| 4.263141230921224 | 0.526 | 0.251 | 0.165 |
| 4.266282823574813 | 0.521 | 0.249 | 0.164 |
| 4.269424416228403 | 0.516 | 0.247 | 0.162 |
| 4.272566008881992 | 0.511 | 0.245 | 0.161 |
| 4.275707601535582 | 0.506 | 0.242 | 0.16 |
| 4.27884919418917 | 0.501 | 0.24 | 0.158 |
| 4.28199078684276 | 0.496 | 0.238 | 0.157 |
| 4.285132379496351 | 0.491 | 0.236 | 0.155 |
| 4.28827397214994 | 0.487 | 0.234 | 0.154 |
| 4.29141556480353 | 0.482 | 0.232 | 0.153 |
| 4.294557157457119 | 0.477 | 0.23 | 0.151 |
| 4.29769875011071 | 0.473 | 0.228 | 0.15 |
| 4.300840342764299 | 0.468 | 0.226 | 0.149 |
| 4.303981935417888 | 0.463 | 0.224 | 0.147 |
| 4.307123528071478 | 0.459 | 0.221 | 0.146 |
| 4.310265120725067 | 0.454 | 0.219 | 0.145 |
| 4.313406713378657 | 0.45 | 0.217 | 0.143 |
| 4.316548306032247 | 0.445 | 0.215 | 0.142 |
| 4.319689898685836 | 0.441 | 0.213 | 0.141 |
| 4.322831491339426 | 0.436 | 0.211 | 0.139 |
| 4.325973083993015 | 0.432 | 0.209 | 0.138 |
| 4.329114676646605 | 0.427 | 0.207 | 0.137 |
| 4.332256269300195 | 0.423 | 0.205 | 0.136 |
| 4.335397861953784 | 0.419 | 0.203 | 0.134 |
| 4.338539454607374 | 0.415 | 0.201 | 0.133 |
| 4.341681047260963 | 0.41 | 0.199 | 0.132 |
| 4.344822639914553 | 0.406 | 0.198 | 0.131 |
| 4.347964232568143 | 0.402 | 0.196 | 0.129 |
| 4.351105825221732 | 0.398 | 0.194 | 0.128 |
| 4.354247417875322 | 0.393 | 0.192 | 0.127 |
| 4.357389010528911 | 0.389 | 0.19 | 0.126 |
| 4.360530603182501 | 0.385 | 0.188 | 0.124 |
| 4.36367219583609 | 0.381 | 0.186 | 0.123 |
| 4.36681378848968 | 0.377 | 0.184 | 0.122 |
| 4.36995538114327 | 0.373 | 0.182 | 0.121 |
| 4.373096973796859 | 0.369 | 0.18 | 0.119 |
| 4.376238566450449 | 0.365 | 0.178 | 0.118 |
| 4.379380159104038 | 0.361 | 0.177 | 0.117 |
| 4.382521751757628 | 0.357 | 0.175 | 0.116 |
| 4.385663344411217 | 0.353 | 0.173 | 0.114 |
| 4.388804937064807 | 0.349 | 0.171 | 0.113 |
| 4.391946529718397 | 0.345 | 0.169 | 0.112 |
| 4.395088122371987 | 0.341 | 0.167 | 0.111 |
| 4.398229715025576 | 0.337 | 0.165 | 0.11 |
| 4.401371307679165 | 0.333 | 0.164 | 0.108 |
| 4.404512900332755 | 0.329 | 0.162 | 0.107 |
| 4.407654492986345 | 0.326 | 0.16 | 0.106 |
| 4.410796085639934 | 0.322 | 0.158 | 0.105 |
| 4.413937678293524 | 0.318 | 0.156 | 0.104 |
| 4.417079270947114 | 0.314 | 0.155 | 0.102 |
| 4.420220863600703 | 0.31 | 0.153 | 0.101 |
| 4.423362456254293 | 0.307 | 0.151 | 0.1 |
| 4.426504048907883 | 0.303 | 0.149 | 0.099 |
| 4.429645641561472 | 0.299 | 0.147 | 0.098 |
| 4.432787234215062 | 0.295 | 0.146 | 0.097 |
| 4.435928826868651 | 0.292 | 0.144 | 0.095 |
| 4.43907041952224 | 0.288 | 0.142 | 0.094 |
| 4.44221201217583 | 0.284 | 0.14 | 0.093 |
| 4.44535360482942 | 0.281 | 0.139 | 0.092 |
| 4.44849519748301 | 0.277 | 0.137 | 0.091 |
| 4.4516367901366 | 0.273 | 0.135 | 0.09 |
| 4.454778382790188 | 0.27 | 0.133 | 0.089 |
| 4.457919975443779 | 0.266 | 0.132 | 0.087 |
| 4.461061568097368 | 0.263 | 0.13 | 0.086 |
| 4.464203160750958 | 0.259 | 0.128 | 0.085 |
| 4.467344753404547 | 0.255 | 0.126 | 0.084 |
| 4.470486346058137 | 0.252 | 0.125 | 0.083 |
| 4.473627938711726 | 0.248 | 0.123 | 0.082 |
| 4.476769531365316 | 0.245 | 0.121 | 0.081 |
| 4.479911124018905 | 0.241 | 0.12 | 0.079 |
| 4.483052716672495 | 0.238 | 0.118 | 0.078 |
| 4.486194309326085 | 0.234 | 0.116 | 0.077 |
| 4.489335901979674 | 0.231 | 0.114 | 0.076 |
| 4.492477494633264 | 0.227 | 0.113 | 0.075 |
| 4.495619087286854 | 0.224 | 0.111 | 0.074 |
| 4.498760679940443 | 0.22 | 0.109 | 0.073 |
| 4.501902272594033 | 0.217 | 0.108 | 0.072 |
| 4.505043865247622 | 0.214 | 0.106 | 0.07 |
| 4.508185457901212 | 0.21 | 0.104 | 0.069 |
| 4.511327050554801 | 0.207 | 0.103 | 0.068 |
| 4.514468643208391 | 0.203 | 0.101 | 0.067 |
| 4.517610235861981 | 0.2 | 0.099 | 0.066 |
| 4.520751828515571 | 0.197 | 0.098 | 0.065 |
| 4.52389342116916 | 0.193 | 0.096 | 0.064 |
| 4.52703501382275 | 0.19 | 0.094 | 0.063 |
| 4.530176606476339 | 0.186 | 0.093 | 0.062 |
| 4.533318199129928 | 0.183 | 0.091 | 0.061 |
| 4.536459791783518 | 0.18 | 0.089 | 0.059 |
| 4.539601384437108 | 0.176 | 0.088 | 0.058 |
| 4.542742977090698 | 0.173 | 0.086 | 0.057 |
| 4.545884569744287 | 0.17 | 0.084 | 0.056 |
| 4.549026162397876 | 0.166 | 0.083 | 0.055 |
| 4.552167755051466 | 0.163 | 0.081 | 0.054 |
| 4.555309347705056 | 0.16 | 0.08 | 0.053 |
| 4.558450940358646 | 0.156 | 0.078 | 0.052 |
| 4.561592533012235 | 0.153 | 0.076 | 0.051 |
| 4.564734125665825 | 0.15 | 0.075 | 0.05 |
| 4.567875718319415 | 0.147 | 0.073 | 0.049 |
| 4.571017310973004 | 0.143 | 0.071 | 0.048 |
| 4.574158903626594 | 0.14 | 0.07 | 0.046 |
| 4.577300496280183 | 0.137 | 0.068 | 0.045 |
| 4.580442088933772 | 0.134 | 0.067 | 0.044 |
| 4.583583681587362 | 0.13 | 0.065 | 0.043 |
| 4.586725274240952 | 0.127 | 0.063 | 0.042 |
| 4.589866866894542 | 0.124 | 0.062 | 0.041 |
| 4.593008459548131 | 0.121 | 0.06 | 0.04 |
| 4.596150052201721 | 0.117 | 0.059 | 0.039 |
| 4.59929164485531 | 0.114 | 0.057 | 0.038 |
| 4.6024332375089 | 0.111 | 0.055 | 0.037 |
| 4.60557483016249 | 0.108 | 0.054 | 0.036 |
| 4.608716422816079 | 0.104 | 0.052 | 0.035 |
| 4.611858015469668 | 0.101 | 0.051 | 0.034 |
| 4.614999608123258 | 0.098 | 0.049 | 0.033 |
| 4.618141200776848 | 0.095 | 0.047 | 0.032 |
| 4.621282793430437 | 0.092 | 0.046 | 0.03 |
| 4.624424386084027 | 0.088 | 0.044 | 0.029 |
| 4.627565978737617 | 0.085 | 0.043 | 0.028 |
| 4.630707571391206 | 0.082 | 0.041 | 0.027 |
| 4.633849164044795 | 0.079 | 0.039 | 0.026 |
| 4.636990756698386 | 0.076 | 0.038 | 0.025 |
| 4.640132349351975 | 0.073 | 0.036 | 0.024 |
| 4.643273942005564 | 0.069 | 0.035 | 0.023 |
| 4.646415534659154 | 0.066 | 0.033 | 0.022 |
| 4.649557127312744 | 0.063 | 0.031 | 0.021 |
| 4.652698719966334 | 0.06 | 0.03 | 0.02 |
| 4.655840312619923 | 0.057 | 0.028 | 0.019 |
| 4.658981905273513 | 0.054 | 0.027 | 0.018 |
| 4.662123497927102 | 0.05 | 0.025 | 0.017 |
| 4.665265090580692 | 0.047 | 0.024 | 0.016 |
| 4.668406683234282 | 0.044 | 0.022 | 0.015 |
| 4.671548275887871 | 0.041 | 0.02 | 0.014 |
| 4.674689868541461 | 0.038 | 0.019 | 0.013 |
| 4.67783146119505 | 0.035 | 0.017 | 0.012 |
| 4.68097305384864 | 0.031 | 0.016 | 0.01 |
| 4.68411464650223 | 0.028 | 0.014 | 0.009 |
| 4.687256239155819 | 0.025 | 0.013 | 0.008 |
| 4.690397831809409 | 0.022 | 0.011 | 0.007 |
| 4.693539424462998 | 0.019 | 0.009 | 0.006 |
| 4.696681017116588 | 0.016 | 0.008 | 0.005 |
| 4.699822609770177 | 0.013 | 0.006 | 0.004 |
| 4.702964202423767 | 0.009 | 0.005 | 0.003 |
| 4.706105795077356 | 0.006 | 0.003 | 0.002 |
| 4.709247387730946 | 0.003 | 0.002 | 0.001 |
| 4.712388980384535 | 0 | 0 | 0 |
| 4.715530573038126 | -0.003 | -0.002 | -0.001 |
| 4.718672165691715 | -0.006 | -0.003 | -0.002 |
| 4.721813758345305 | -0.009 | -0.005 | -0.003 |
| 4.724955350998894 | -0.013 | -0.006 | -0.004 |
| 4.728096943652484 | -0.016 | -0.008 | -0.005 |
| 4.731238536306074 | -0.019 | -0.009 | -0.006 |
| 4.734380128959663 | -0.022 | -0.011 | -0.007 |
| 4.737521721613253 | -0.025 | -0.013 | -0.008 |
| 4.740663314266842 | -0.028 | -0.014 | -0.009 |
| 4.743804906920432 | -0.031 | -0.016 | -0.01 |
| 4.74694649957402 | -0.035 | -0.017 | -0.012 |
| 4.750088092227611 | -0.038 | -0.019 | -0.013 |
| 4.7532296848812 | -0.041 | -0.02 | -0.014 |
| 4.75637127753479 | -0.044 | -0.022 | -0.015 |
| 4.75951287018838 | -0.047 | -0.024 | -0.016 |
| 4.76265446284197 | -0.05 | -0.025 | -0.017 |
| 4.765796055495559 | -0.054 | -0.027 | -0.018 |
| 4.768937648149149 | -0.057 | -0.028 | -0.019 |
| 4.772079240802738 | -0.06 | -0.03 | -0.02 |
| 4.775220833456327 | -0.063 | -0.031 | -0.021 |
| 4.778362426109917 | -0.066 | -0.033 | -0.022 |
| 4.781504018763507 | -0.069 | -0.035 | -0.023 |
| 4.784645611417097 | -0.073 | -0.036 | -0.024 |
| 4.787787204070686 | -0.076 | -0.038 | -0.025 |
| 4.790928796724275 | -0.079 | -0.039 | -0.026 |
| 4.794070389377865 | -0.082 | -0.041 | -0.027 |
| 4.797211982031455 | -0.085 | -0.043 | -0.028 |
| 4.800353574685045 | -0.088 | -0.044 | -0.029 |
| 4.803495167338634 | -0.092 | -0.046 | -0.03 |
| 4.806636759992224 | -0.095 | -0.047 | -0.032 |
| 4.809778352645814 | -0.098 | -0.049 | -0.033 |
| 4.812919945299403 | -0.101 | -0.051 | -0.034 |
| 4.816061537952993 | -0.104 | -0.052 | -0.035 |
| 4.819203130606582 | -0.108 | -0.054 | -0.036 |
| 4.822344723260172 | -0.111 | -0.055 | -0.037 |
| 4.825486315913761 | -0.114 | -0.057 | -0.038 |
| 4.828627908567351 | -0.117 | -0.059 | -0.039 |
| 4.83176950122094 | -0.121 | -0.06 | -0.04 |
| 4.83491109387453 | -0.124 | -0.062 | -0.041 |
| 4.83805268652812 | -0.127 | -0.063 | -0.042 |
| 4.841194279181709 | -0.13 | -0.065 | -0.043 |
| 4.844335871835299 | -0.134 | -0.067 | -0.044 |
| 4.847477464488889 | -0.137 | -0.068 | -0.045 |
| 4.850619057142478 | -0.14 | -0.07 | -0.046 |
| 4.853760649796068 | -0.143 | -0.071 | -0.048 |
| 4.856902242449657 | -0.147 | -0.073 | -0.049 |
| 4.860043835103247 | -0.15 | -0.075 | -0.05 |
| 4.863185427756837 | -0.153 | -0.076 | -0.051 |
| 4.866327020410426 | -0.156 | -0.078 | -0.052 |
| 4.869468613064015 | -0.16 | -0.08 | -0.053 |
| 4.872610205717605 | -0.163 | -0.081 | -0.054 |
| 4.875751798371195 | -0.166 | -0.083 | -0.055 |
| 4.878893391024784 | -0.17 | -0.084 | -0.056 |
| 4.882034983678374 | -0.173 | -0.086 | -0.057 |
| 4.885176576331964 | -0.176 | -0.088 | -0.058 |
| 4.888318168985553 | -0.18 | -0.089 | -0.059 |
| 4.891459761639143 | -0.183 | -0.091 | -0.061 |
| 4.894601354292733 | -0.186 | -0.093 | -0.062 |
| 4.897742946946322 | -0.19 | -0.094 | -0.063 |
| 4.900884539599912 | -0.193 | -0.096 | -0.064 |
| 4.904026132253501 | -0.197 | -0.098 | -0.065 |
| 4.907167724907091 | -0.2 | -0.099 | -0.066 |
| 4.91030931756068 | -0.203 | -0.101 | -0.067 |
| 4.91345091021427 | -0.207 | -0.103 | -0.068 |
| 4.91659250286786 | -0.21 | -0.104 | -0.069 |
| 4.91973409552145 | -0.214 | -0.106 | -0.07 |
| 4.922875688175039 | -0.217 | -0.108 | -0.072 |
| 4.926017280828628 | -0.22 | -0.109 | -0.073 |
| 4.929158873482218 | -0.224 | -0.111 | -0.074 |
| 4.932300466135808 | -0.227 | -0.113 | -0.075 |
| 4.935442058789397 | -0.231 | -0.114 | -0.076 |
| 4.938583651442987 | -0.234 | -0.116 | -0.077 |
| 4.941725244096576 | -0.238 | -0.118 | -0.078 |
| 4.944866836750166 | -0.241 | -0.12 | -0.079 |
| 4.948008429403755 | -0.245 | -0.121 | -0.081 |
| 4.951150022057345 | -0.248 | -0.123 | -0.082 |
| 4.954291614710935 | -0.252 | -0.125 | -0.083 |
| 4.957433207364524 | -0.255 | -0.126 | -0.084 |
| 4.960574800018114 | -0.259 | -0.128 | -0.085 |
| 4.963716392671704 | -0.263 | -0.13 | -0.086 |
| 4.966857985325293 | -0.266 | -0.132 | -0.087 |
| 4.969999577978883 | -0.27 | -0.133 | -0.089 |
| 4.973141170632472 | -0.273 | -0.135 | -0.09 |
| 4.976282763286062 | -0.277 | -0.137 | -0.091 |
| 4.979424355939651 | -0.281 | -0.139 | -0.092 |
| 4.982565948593241 | -0.284 | -0.14 | -0.093 |
| 4.985707541246831 | -0.288 | -0.142 | -0.094 |
| 4.98884913390042 | -0.292 | -0.144 | -0.095 |
| 4.99199072655401 | -0.295 | -0.146 | -0.097 |
| 4.9951323192076 | -0.299 | -0.147 | -0.098 |
| 4.99827391186119 | -0.303 | -0.149 | -0.099 |
| 5.00141550451478 | -0.307 | -0.151 | -0.1 |
| 5.004557097168369 | -0.31 | -0.153 | -0.101 |
| 5.007698689821958 | -0.314 | -0.155 | -0.102 |
| 5.010840282475548 | -0.318 | -0.156 | -0.104 |
| 5.013981875129137 | -0.322 | -0.158 | -0.105 |
| 5.017123467782727 | -0.326 | -0.16 | -0.106 |
| 5.020265060436317 | -0.329 | -0.162 | -0.107 |
| 5.023406653089906 | -0.333 | -0.164 | -0.108 |
| 5.026548245743496 | -0.337 | -0.165 | -0.11 |
| 5.029689838397085 | -0.341 | -0.167 | -0.111 |
| 5.032831431050674 | -0.345 | -0.169 | -0.112 |
| 5.035973023704264 | -0.349 | -0.171 | -0.113 |
| 5.039114616357854 | -0.353 | -0.173 | -0.114 |
| 5.042256209011444 | -0.357 | -0.175 | -0.116 |
| 5.045397801665033 | -0.361 | -0.177 | -0.117 |
| 5.048539394318622 | -0.365 | -0.178 | -0.118 |
| 5.051680986972213 | -0.369 | -0.18 | -0.119 |
| 5.054822579625802 | -0.373 | -0.182 | -0.121 |
| 5.057964172279392 | -0.377 | -0.184 | -0.122 |
| 5.061105764932981 | -0.381 | -0.186 | -0.123 |
| 5.064247357586571 | -0.385 | -0.188 | -0.124 |
| 5.067388950240161 | -0.389 | -0.19 | -0.126 |
| 5.07053054289375 | -0.393 | -0.192 | -0.127 |
| 5.07367213554734 | -0.398 | -0.194 | -0.128 |
| 5.07681372820093 | -0.402 | -0.196 | -0.129 |
| 5.079955320854519 | -0.406 | -0.198 | -0.131 |
| 5.083096913508108 | -0.41 | -0.199 | -0.132 |
| 5.086238506161698 | -0.415 | -0.201 | -0.133 |
| 5.089380098815288 | -0.419 | -0.203 | -0.134 |
| 5.092521691468877 | -0.423 | -0.205 | -0.136 |
| 5.095663284122466 | -0.427 | -0.207 | -0.137 |
| 5.098804876776057 | -0.432 | -0.209 | -0.138 |
| 5.101946469429646 | -0.436 | -0.211 | -0.139 |
| 5.105088062083236 | -0.441 | -0.213 | -0.141 |
| 5.108229654736825 | -0.445 | -0.215 | -0.142 |
| 5.111371247390415 | -0.45 | -0.217 | -0.143 |
| 5.114512840044005 | -0.454 | -0.219 | -0.145 |
| 5.117654432697594 | -0.459 | -0.221 | -0.146 |
| 5.120796025351184 | -0.463 | -0.224 | -0.147 |
| 5.123937618004773 | -0.468 | -0.226 | -0.149 |
| 5.127079210658363 | -0.473 | -0.228 | -0.15 |
| 5.130220803311953 | -0.477 | -0.23 | -0.151 |
| 5.133362395965542 | -0.482 | -0.232 | -0.153 |
| 5.136503988619131 | -0.487 | -0.234 | -0.154 |
| 5.13964558127272 | -0.491 | -0.236 | -0.155 |
| 5.142787173926311 | -0.496 | -0.238 | -0.157 |
| 5.1459287665799 | -0.501 | -0.24 | -0.158 |
| 5.14907035923349 | -0.506 | -0.242 | -0.16 |
| 5.15221195188708 | -0.511 | -0.245 | -0.161 |
| 5.15535354454067 | -0.516 | -0.247 | -0.162 |
| 5.158495137194259 | -0.521 | -0.249 | -0.164 |
| 5.161636729847848 | -0.526 | -0.251 | -0.165 |
| 5.164778322501438 | -0.531 | -0.253 | -0.166 |
| 5.167919915155028 | -0.536 | -0.256 | -0.168 |
| 5.171061507808617 | -0.541 | -0.258 | -0.169 |
| 5.174203100462206 | -0.546 | -0.26 | -0.171 |
| 5.177344693115796 | -0.551 | -0.262 | -0.172 |
| 5.180486285769386 | -0.557 | -0.264 | -0.174 |
| 5.183627878422976 | -0.562 | -0.267 | -0.175 |
| 5.186769471076565 | -0.567 | -0.269 | -0.176 |
| 5.189911063730155 | -0.573 | -0.271 | -0.178 |
| 5.193052656383744 | -0.578 | -0.274 | -0.179 |
| 5.196194249037334 | -0.584 | -0.276 | -0.181 |
| 5.199335841690924 | -0.589 | -0.278 | -0.182 |
| 5.202477434344513 | -0.595 | -0.281 | -0.184 |
| 5.205619026998103 | -0.601 | -0.283 | -0.185 |
| 5.208760619651692 | -0.606 | -0.285 | -0.187 |
| 5.211902212305282 | -0.612 | -0.288 | -0.188 |
| 5.215043804958871 | -0.618 | -0.29 | -0.19 |
| 5.218185397612461 | -0.624 | -0.293 | -0.191 |
| 5.221326990266051 | -0.63 | -0.295 | -0.193 |
| 5.22446858291964 | -0.636 | -0.297 | -0.194 |
| 5.22761017557323 | -0.642 | -0.3 | -0.196 |
| 5.23075176822682 | -0.648 | -0.302 | -0.197 |
| 5.23389336088041 | -0.654 | -0.305 | -0.199 |
| 5.237034953533999 | -0.661 | -0.307 | -0.201 |
| 5.240176546187588 | -0.667 | -0.31 | -0.202 |
| 5.243318138841178 | -0.673 | -0.312 | -0.204 |
| 5.246459731494767 | -0.68 | -0.315 | -0.205 |
| 5.249601324148357 | -0.686 | -0.318 | -0.207 |
| 5.252742916801947 | -0.693 | -0.32 | -0.209 |
| 5.255884509455536 | -0.7 | -0.323 | -0.21 |
| 5.259026102109125 | -0.707 | -0.325 | -0.212 |
| 5.262167694762715 | -0.713 | -0.328 | -0.213 |
| 5.265309287416305 | -0.72 | -0.331 | -0.215 |
| 5.268450880069895 | -0.727 | -0.333 | -0.217 |
| 5.271592472723484 | -0.735 | -0.336 | -0.218 |
| 5.274734065377074 | -0.742 | -0.339 | -0.22 |
| 5.277875658030664 | -0.749 | -0.342 | -0.222 |
| 5.281017250684253 | -0.757 | -0.344 | -0.224 |
| 5.284158843337843 | -0.764 | -0.347 | -0.225 |
| 5.287300435991432 | -0.772 | -0.35 | -0.227 |
| 5.290442028645022 | -0.779 | -0.353 | -0.229 |
| 5.293583621298612 | -0.787 | -0.356 | -0.23 |
| 5.296725213952201 | -0.795 | -0.359 | -0.232 |
| 5.299866806605791 | -0.803 | -0.361 | -0.234 |
| 5.30300839925938 | -0.812 | -0.364 | -0.236 |
| 5.30614999191297 | -0.82 | -0.367 | -0.238 |
| 5.30929158456656 | -0.828 | -0.37 | -0.239 |
| 5.312433177220149 | -0.837 | -0.373 | -0.241 |
| 5.315574769873739 | -0.846 | -0.376 | -0.243 |
| 5.318716362527328 | -0.855 | -0.379 | -0.245 |
| 5.321857955180918 | -0.864 | -0.382 | -0.247 |
| 5.324999547834508 | -0.873 | -0.386 | -0.249 |
| 5.328141140488097 | -0.882 | -0.389 | -0.25 |
| 5.331282733141686 | -0.892 | -0.392 | -0.252 |
| 5.334424325795276 | -0.901 | -0.395 | -0.254 |
| 5.337565918448866 | -0.911 | -0.398 | -0.256 |
| 5.340707511102456 | -0.921 | -0.401 | -0.258 |
| 5.343849103756045 | -0.932 | -0.405 | -0.26 |
| 5.346990696409634 | -0.942 | -0.408 | -0.262 |
| 5.350132289063224 | -0.953 | -0.411 | -0.264 |
| 5.353273881716814 | -0.964 | -0.415 | -0.266 |
| 5.356415474370403 | -0.975 | -0.418 | -0.268 |
| 5.359557067023993 | -0.986 | -0.422 | -0.27 |
| 5.362698659677583 | -0.998 | -0.425 | -0.272 |
| 5.365840252331172 | -1.01 | -0.429 | -0.274 |
| 5.368981844984762 | -1.022 | -0.432 | -0.276 |
| 5.372123437638351 | -1.034 | -0.436 | -0.278 |
| 5.375265030291941 | -1.047 | -0.439 | -0.28 |
| 5.378406622945531 | -1.06 | -0.443 | -0.283 |
| 5.38154821559912 | -1.074 | -0.447 | -0.285 |
| 5.38468980825271 | -1.088 | -0.45 | -0.287 |
| 5.387831400906299 | -1.102 | -0.454 | -0.289 |
| 5.39097299355989 | -1.116 | -0.458 | -0.291 |
| 5.394114586213479 | -1.131 | -0.462 | -0.293 |
| 5.397256178867068 | -1.147 | -0.466 | -0.296 |
| 5.400397771520657 | -1.163 | -0.47 | -0.298 |
| 5.403539364174247 | -1.179 | -0.474 | -0.3 |
| 5.406680956827837 | -1.196 | -0.478 | -0.302 |
| 5.409822549481426 | -1.214 | -0.482 | -0.305 |
| 5.412964142135016 | -1.232 | -0.486 | -0.307 |
| 5.416105734788605 | -1.251 | -0.49 | -0.309 |
| 5.419247327442195 | -1.271 | -0.494 | -0.312 |
| 5.422388920095785 | -1.292 | -0.499 | -0.314 |
| 5.425530512749375 | -1.313 | -0.503 | -0.317 |
| 5.428672105402964 | -1.335 | -0.508 | -0.319 |
| 5.431813698056554 | -1.359 | -0.512 | -0.322 |
| 5.434955290710143 | -1.383 | -0.517 | -0.324 |
| 5.438096883363733 | -1.409 | -0.521 | -0.327 |
| 5.441238476017322 | -1.436 | -0.526 | -0.329 |
| 5.444380068670912 | -1.464 | -0.531 | -0.332 |
| 5.447521661324502 | -1.495 | -0.535 | -0.334 |
| 5.450663253978091 | -1.527 | -0.54 | -0.337 |
| 5.453804846631681 | -1.562 | -0.545 | -0.34 |
| 5.456946439285271 | -1.599 | -0.55 | -0.342 |
| 5.46008803193886 | -1.639 | -0.555 | -0.345 |
| 5.46322962459245 | -1.682 | -0.56 | -0.348 |
| 5.466371217246039 | -1.73 | -0.566 | -0.351 |
| 5.46951280989963 | -1.783 | -0.571 | -0.353 |
| 5.472654402553218 | -1.842 | -0.576 | -0.356 |
| 5.475795995206808 | -1.908 | -0.582 | -0.359 |
| 5.478937587860398 | -1.986 | -0.588 | -0.362 |
| 5.482079180513987 | -2.077 | -0.593 | -0.365 |
| 5.485220773167577 | -2.188 | -0.599 | -0.368 |
| 5.488362365821166 | -2.332 | -0.605 | -0.371 |
| 5.491503958474756 | -2.535 | -0.611 | -0.374 |
| 5.494645551128346 | -2.882 | -0.617 | -0.377 |
| 5.497787143781935 | -14.613 | -0.623 | -0.38 |
| 5.500928736435525 | -2.882 | -0.63 | -0.383 |
| 5.504070329089115 | -2.535 | -0.636 | -0.387 |
| 5.507211921742704 | -2.332 | -0.643 | -0.39 |
| 5.510353514396294 | -2.188 | -0.649 | -0.393 |
| 5.513495107049883 | -2.077 | -0.656 | -0.396 |
| 5.516636699703473 | -1.986 | -0.663 | -0.4 |
| 5.519778292357062 | -1.908 | -0.67 | -0.403 |
| 5.522919885010652 | -1.842 | -0.678 | -0.407 |
| 5.526061477664242 | -1.783 | -0.685 | -0.41 |
| 5.529203070317831 | -1.73 | -0.693 | -0.414 |
| 5.532344662971421 | -1.682 | -0.701 | -0.417 |
| 5.535486255625011 | -1.639 | -0.709 | -0.421 |
| 5.5386278482786 | -1.599 | -0.717 | -0.425 |
| 5.54176944093219 | -1.562 | -0.725 | -0.429 |
| 5.544911033585779 | -1.527 | -0.734 | -0.432 |
| 5.54805262623937 | -1.495 | -0.743 | -0.436 |
| 5.551194218892959 | -1.464 | -0.752 | -0.44 |
| 5.554335811546548 | -1.436 | -0.761 | -0.444 |
| 5.557477404200137 | -1.409 | -0.771 | -0.448 |
| 5.560618996853727 | -1.383 | -0.781 | -0.453 |
| 5.563760589507317 | -1.359 | -0.791 | -0.457 |
| 5.566902182160906 | -1.335 | -0.802 | -0.461 |
| 5.570043774814496 | -1.313 | -0.813 | -0.465 |
| 5.573185367468086 | -1.292 | -0.824 | -0.47 |
| 5.576326960121675 | -1.271 | -0.835 | -0.474 |
| 5.579468552775264 | -1.251 | -0.847 | -0.479 |
| 5.582610145428854 | -1.232 | -0.86 | -0.484 |
| 5.585751738082444 | -1.214 | -0.873 | -0.489 |
| 5.588893330736034 | -1.196 | -0.886 | -0.493 |
| 5.592034923389623 | -1.179 | -0.901 | -0.498 |
| 5.595176516043213 | -1.163 | -0.915 | -0.503 |
| 5.598318108696803 | -1.147 | -0.93 | -0.509 |
| 5.601459701350392 | -1.131 | -0.947 | -0.514 |
| 5.604601294003982 | -1.116 | -0.963 | -0.519 |
| 5.607742886657571 | -1.102 | -0.981 | -0.525 |
| 5.610884479311161 | -1.088 | -1 | -0.53 |
| 5.61402607196475 | -1.074 | -1.02 | -0.536 |
| 5.61716766461834 | -1.06 | -1.041 | -0.542 |
| 5.62030925727193 | -1.047 | -1.063 | -0.548 |
| 5.623450849925519 | -1.034 | -1.087 | -0.554 |
| 5.626592442579109 | -1.022 | -1.112 | -0.561 |
| 5.629734035232698 | -1.01 | -1.14 | -0.567 |
| 5.632875627886288 | -0.998 | -1.17 | -0.574 |
| 5.636017220539878 | -0.986 | -1.203 | -0.581 |
| 5.639158813193467 | -0.975 | -1.24 | -0.588 |
| 5.642300405847057 | -0.964 | -1.281 | -0.595 |
| 5.645441998500646 | -0.953 | -1.327 | -0.602 |
| 5.648583591154236 | -0.942 | -1.38 | -0.61 |
| 5.651725183807825 | -0.932 | -1.444 | -0.618 |
| 5.654866776461415 | -0.921 | -1.521 | -0.626 |
| 5.658008369115005 | -0.911 | -1.619 | -0.634 |
| 5.661149961768594 | -0.901 | -1.757 | -0.643 |
| 5.664291554422184 | -0.892 | -1.988 | -0.652 |
| 5.667433147075774 | -0.882 | -2.881 | -0.661 |
| 5.670574739729363 | -0.873 | -2.048 | -0.671 |
| 5.673716332382953 | -0.864 | -1.787 | -0.68 |
| 5.676857925036542 | -0.855 | -1.638 | -0.691 |
| 5.679999517690132 | -0.846 | -1.533 | -0.701 |
| 5.683141110343721 | -0.837 | -1.452 | -0.713 |
| 5.686282702997311 | -0.828 | -1.386 | -0.724 |
| 5.689424295650901 | -0.82 | -1.33 | -0.736 |
| 5.69256588830449 | -0.812 | -1.282 | -0.749 |
| 5.69570748095808 | -0.803 | -1.24 | -0.763 |
| 5.69884907361167 | -0.795 | -1.202 | -0.777 |
| 5.701990666265259 | -0.787 | -1.167 | -0.792 |
| 5.705132258918849 | -0.779 | -1.136 | -0.807 |
| 5.708273851572438 | -0.772 | -1.107 | -0.824 |
| 5.711415444226028 | -0.764 | -1.08 | -0.842 |
| 5.714557036879618 | -0.757 | -1.055 | -0.861 |
| 5.717698629533207 | -0.749 | -1.032 | -0.881 |
| 5.720840222186797 | -0.742 | -1.01 | -0.903 |
| 5.723981814840386 | -0.735 | -0.989 | -0.927 |
| 5.727123407493976 | -0.727 | -0.969 | -0.953 |
| 5.730265000147565 | -0.72 | -0.951 | -0.982 |
| 5.733406592801155 | -0.713 | -0.933 | -1.014 |
| 5.736548185454744 | -0.707 | -0.916 | -1.051 |
| 5.739689778108334 | -0.7 | -0.9 | -1.093 |
| 5.742831370761924 | -0.693 | -0.884 | -1.142 |
| 5.745972963415514 | -0.686 | -0.869 | -1.201 |
| 5.749114556069103 | -0.68 | -0.855 | -1.276 |
| 5.752256148722693 | -0.673 | -0.841 | -1.379 |
| 5.755397741376282 | -0.667 | -0.828 | -1.54 |
| 5.758539334029872 | -0.661 | -0.815 | -3 |
| 5.761680926683462 | -0.654 | -0.802 | -1.739 |
| 5.764822519337051 | -0.648 | -0.79 | -1.474 |
| 5.767964111990641 | -0.642 | -0.778 | -1.338 |
| 5.77110570464423 | -0.636 | -0.767 | -1.245 |
| 5.77424729729782 | -0.63 | -0.756 | -1.175 |
| 5.77738888995141 | -0.624 | -0.745 | -1.118 |
| 5.780530482605 | -0.618 | -0.735 | -1.071 |
| 5.783672075258588 | -0.612 | -0.724 | -1.03 |
| 5.786813667912178 | -0.606 | -0.714 | -0.994 |
| 5.789955260565768 | -0.601 | -0.705 | -0.962 |
| 5.793096853219358 | -0.595 | -0.695 | -0.933 |
| 5.796238445872947 | -0.589 | -0.686 | -0.907 |
| 5.799380038526537 | -0.584 | -0.677 | -0.882 |
| 5.802521631180126 | -0.578 | -0.668 | -0.86 |
| 5.805663223833715 | -0.573 | -0.659 | -0.839 |
| 5.808804816487306 | -0.567 | -0.651 | -0.819 |
| 5.811946409140895 | -0.562 | -0.643 | -0.801 |
| 5.815088001794485 | -0.557 | -0.635 | -0.783 |
| 5.818229594448074 | -0.551 | -0.627 | -0.767 |
| 5.821371187101663 | -0.546 | -0.619 | -0.751 |
| 5.824512779755254 | -0.541 | -0.611 | -0.736 |
| 5.827654372408843 | -0.536 | -0.603 | -0.722 |
| 5.830795965062433 | -0.531 | -0.596 | -0.709 |
| 5.833937557716022 | -0.526 | -0.589 | -0.696 |
| 5.837079150369612 | -0.521 | -0.582 | -0.683 |
| 5.840220743023201 | -0.516 | -0.574 | -0.671 |
| 5.843362335676791 | -0.511 | -0.568 | -0.659 |
| 5.846503928330381 | -0.506 | -0.561 | -0.648 |
| 5.84964552098397 | -0.501 | -0.554 | -0.637 |
| 5.85278711363756 | -0.496 | -0.547 | -0.627 |
| 5.85592870629115 | -0.491 | -0.541 | -0.616 |
| 5.85907029894474 | -0.487 | -0.534 | -0.607 |
| 5.862211891598329 | -0.482 | -0.528 | -0.597 |
| 5.865353484251918 | -0.477 | -0.522 | -0.588 |
| 5.868495076905508 | -0.473 | -0.516 | -0.579 |
| 5.871636669559098 | -0.468 | -0.51 | -0.57 |
| 5.874778262212687 | -0.463 | -0.504 | -0.561 |
| 5.877919854866277 | -0.459 | -0.498 | -0.553 |
| 5.881061447519866 | -0.454 | -0.492 | -0.544 |
| 5.884203040173456 | -0.45 | -0.486 | -0.536 |
| 5.887344632827046 | -0.445 | -0.48 | -0.529 |
| 5.890486225480635 | -0.441 | -0.475 | -0.521 |
| 5.893627818134224 | -0.436 | -0.469 | -0.513 |
| 5.896769410787814 | -0.432 | -0.464 | -0.506 |
| 5.899911003441404 | -0.427 | -0.458 | -0.499 |
| 5.903052596094994 | -0.423 | -0.453 | -0.492 |
| 5.906194188748583 | -0.419 | -0.447 | -0.485 |
| 5.909335781402172 | -0.415 | -0.442 | -0.478 |
| 5.912477374055762 | -0.41 | -0.437 | -0.471 |
| 5.915618966709352 | -0.406 | -0.432 | -0.465 |
| 5.918760559362942 | -0.402 | -0.427 | -0.458 |
| 5.921902152016531 | -0.398 | -0.422 | -0.452 |
| 5.92504374467012 | -0.393 | -0.417 | -0.446 |
| 5.92818533732371 | -0.389 | -0.412 | -0.44 |
| 5.9313269299773 | -0.385 | -0.407 | -0.434 |
| 5.93446852263089 | -0.381 | -0.402 | -0.428 |
| 5.93761011528448 | -0.377 | -0.397 | -0.422 |
| 5.940751707938068 | -0.373 | -0.392 | -0.416 |
| 5.943893300591658 | -0.369 | -0.388 | -0.411 |
| 5.947034893245248 | -0.365 | -0.383 | -0.405 |
| 5.950176485898837 | -0.361 | -0.378 | -0.399 |
| 5.953318078552427 | -0.357 | -0.374 | -0.394 |
| 5.956459671206017 | -0.353 | -0.369 | -0.389 |
| 5.959601263859606 | -0.349 | -0.365 | -0.383 |
| 5.962742856513196 | -0.345 | -0.36 | -0.378 |
| 5.965884449166785 | -0.341 | -0.356 | -0.373 |
| 5.969026041820375 | -0.337 | -0.351 | -0.368 |
| 5.972167634473964 | -0.333 | -0.347 | -0.363 |
| 5.975309227127554 | -0.329 | -0.342 | -0.358 |
| 5.978450819781144 | -0.326 | -0.338 | -0.353 |
| 5.981592412434733 | -0.322 | -0.334 | -0.348 |
| 5.984734005088323 | -0.318 | -0.33 | -0.343 |
| 5.987875597741913 | -0.314 | -0.325 | -0.338 |
| 5.991017190395502 | -0.31 | -0.321 | -0.334 |
| 5.994158783049092 | -0.307 | -0.317 | -0.329 |
| 5.997300375702681 | -0.303 | -0.313 | -0.324 |
| 6.000441968356271 | -0.299 | -0.309 | -0.32 |
| 6.003583561009861 | -0.295 | -0.305 | -0.315 |
| 6.00672515366345 | -0.292 | -0.301 | -0.311 |
| 6.00986674631704 | -0.288 | -0.297 | -0.306 |
| 6.01300833897063 | -0.284 | -0.293 | -0.302 |
| 6.01614993162422 | -0.281 | -0.289 | -0.297 |
| 6.019291524277808 | -0.277 | -0.285 | -0.293 |
| 6.022433116931398 | -0.273 | -0.281 | -0.289 |
| 6.025574709584988 | -0.27 | -0.277 | -0.284 |
| 6.028716302238577 | -0.266 | -0.273 | -0.28 |
| 6.031857894892167 | -0.263 | -0.269 | -0.276 |
| 6.034999487545757 | -0.259 | -0.265 | -0.272 |
| 6.038141080199346 | -0.255 | -0.261 | -0.268 |
| 6.041282672852935 | -0.252 | -0.258 | -0.264 |
| 6.044424265506525 | -0.248 | -0.254 | -0.26 |
| 6.047565858160115 | -0.245 | -0.25 | -0.256 |
| 6.050707450813704 | -0.241 | -0.246 | -0.252 |
| 6.053849043467294 | -0.238 | -0.243 | -0.248 |
| 6.056990636120884 | -0.234 | -0.239 | -0.244 |
| 6.060132228774473 | -0.231 | -0.235 | -0.24 |
| 6.063273821428063 | -0.227 | -0.231 | -0.236 |
| 6.066415414081653 | -0.224 | -0.228 | -0.232 |
| 6.069557006735242 | -0.22 | -0.224 | -0.228 |
| 6.072698599388831 | -0.217 | -0.221 | -0.224 |
| 6.07584019204242 | -0.214 | -0.217 | -0.22 |
| 6.078981784696011 | -0.21 | -0.213 | -0.217 |
| 6.082123377349601 | -0.207 | -0.21 | -0.213 |
| 6.08526497000319 | -0.203 | -0.206 | -0.209 |
| 6.08840656265678 | -0.2 | -0.203 | -0.206 |
| 6.09154815531037 | -0.197 | -0.199 | -0.202 |
| 6.094689747963959 | -0.193 | -0.196 | -0.198 |
| 6.097831340617549 | -0.19 | -0.192 | -0.195 |
| 6.100972933271138 | -0.186 | -0.189 | -0.191 |
| 6.104114525924728 | -0.183 | -0.185 | -0.187 |
| 6.107256118578317 | -0.18 | -0.182 | -0.184 |
| 6.110397711231907 | -0.176 | -0.178 | -0.18 |
| 6.113539303885497 | -0.173 | -0.175 | -0.177 |
| 6.116680896539086 | -0.17 | -0.171 | -0.173 |
| 6.119822489192675 | -0.166 | -0.168 | -0.17 |
| 6.122964081846265 | -0.163 | -0.165 | -0.166 |
| 6.126105674499855 | -0.16 | -0.161 | -0.163 |
| 6.129247267153445 | -0.156 | -0.158 | -0.159 |
| 6.132388859807034 | -0.153 | -0.154 | -0.156 |
| 6.135530452460624 | -0.15 | -0.151 | -0.152 |
| 6.138672045114213 | -0.147 | -0.148 | -0.149 |
| 6.141813637767803 | -0.143 | -0.144 | -0.145 |
| 6.144955230421393 | -0.14 | -0.141 | -0.142 |
| 6.148096823074982 | -0.137 | -0.138 | -0.139 |
| 6.151238415728571 | -0.134 | -0.134 | -0.135 |
| 6.154380008382161 | -0.13 | -0.131 | -0.132 |
| 6.157521601035751 | -0.127 | -0.128 | -0.128 |
| 6.16066319368934 | -0.124 | -0.124 | -0.125 |
| 6.16380478634293 | -0.121 | -0.121 | -0.122 |
| 6.16694637899652 | -0.117 | -0.118 | -0.118 |
| 6.170087971650109 | -0.114 | -0.115 | -0.115 |
| 6.173229564303698 | -0.111 | -0.111 | -0.112 |
| 6.176371156957289 | -0.108 | -0.108 | -0.108 |
| 6.179512749610878 | -0.104 | -0.105 | -0.105 |
| 6.182654342264468 | -0.101 | -0.102 | -0.102 |
| 6.185795934918057 | -0.098 | -0.098 | -0.099 |
| 6.188937527571647 | -0.095 | -0.095 | -0.095 |
| 6.192079120225237 | -0.092 | -0.092 | -0.092 |
| 6.195220712878826 | -0.088 | -0.089 | -0.089 |
| 6.198362305532415 | -0.085 | -0.085 | -0.086 |
| 6.201503898186005 | -0.082 | -0.082 | -0.082 |
| 6.204645490839594 | -0.079 | -0.079 | -0.079 |
| 6.207787083493184 | -0.076 | -0.076 | -0.076 |
| 6.210928676146774 | -0.073 | -0.073 | -0.073 |
| 6.214070268800364 | -0.069 | -0.069 | -0.07 |
| 6.217211861453953 | -0.066 | -0.066 | -0.066 |
| 6.220353454107543 | -0.063 | -0.063 | -0.063 |
| 6.223495046761133 | -0.06 | -0.06 | -0.06 |
| 6.226636639414722 | -0.057 | -0.057 | -0.057 |
| 6.229778232068312 | -0.054 | -0.054 | -0.054 |
| 6.232919824721901 | -0.05 | -0.05 | -0.05 |
| 6.236061417375491 | -0.047 | -0.047 | -0.047 |
| 6.23920301002908 | -0.044 | -0.044 | -0.044 |
| 6.24234460268267 | -0.041 | -0.041 | -0.041 |
| 6.24548619533626 | -0.038 | -0.038 | -0.038 |
| 6.24862778798985 | -0.035 | -0.035 | -0.035 |
| 6.251769380643438 | -0.031 | -0.031 | -0.031 |
| 6.254910973297028 | -0.028 | -0.028 | -0.028 |
| 6.258052565950618 | -0.025 | -0.025 | -0.025 |
| 6.261194158604208 | -0.022 | -0.022 | -0.022 |
| 6.264335751257797 | -0.019 | -0.019 | -0.019 |
| 6.267477343911387 | -0.016 | -0.016 | -0.016 |
| 6.270618936564976 | -0.013 | -0.013 | -0.013 |
| 6.273760529218566 | -0.009 | -0.009 | -0.009 |
| 6.276902121872155 | -0.006 | -0.006 | -0.006 |
| 6.280043714525745 | -0.003 | -0.003 | -0.003 |
| 6.283185307179335 | 0 | 0 | 0 |